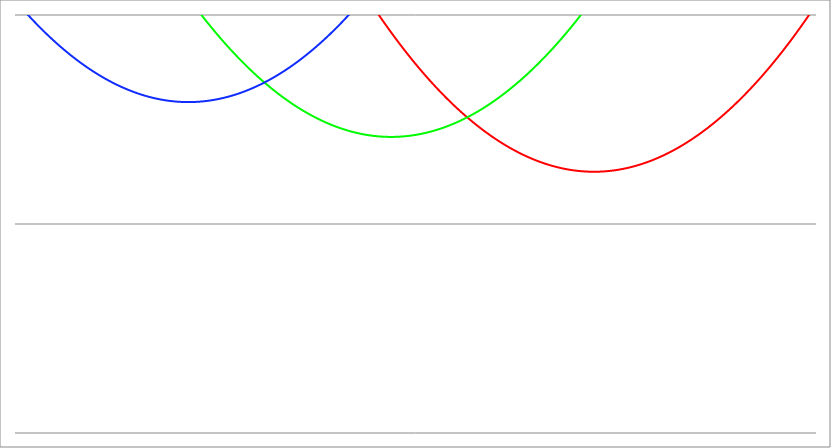
| Category | Series 1 | Series 0 | Series 2 |
|---|---|---|---|
| -3.7 | 33.99 | 16.19 | 6.39 |
| -3.69605 | 33.945 | 16.161 | 6.377 |
| -3.6921 | 33.9 | 16.132 | 6.363 |
| -3.68815 | 33.855 | 16.102 | 6.35 |
| -3.6842 | 33.81 | 16.073 | 6.337 |
| -3.680249999999999 | 33.765 | 16.044 | 6.323 |
| -3.676299999999999 | 33.72 | 16.015 | 6.31 |
| -3.672349999999999 | 33.676 | 15.986 | 6.297 |
| -3.6684 | 33.631 | 15.957 | 6.284 |
| -3.664449999999999 | 33.586 | 15.928 | 6.27 |
| -3.660499999999999 | 33.541 | 15.899 | 6.257 |
| -3.656549999999999 | 33.497 | 15.87 | 6.244 |
| -3.652599999999999 | 33.452 | 15.841 | 6.231 |
| -3.648649999999999 | 33.407 | 15.813 | 6.218 |
| -3.644699999999998 | 33.363 | 15.784 | 6.205 |
| -3.640749999999998 | 33.318 | 15.755 | 6.192 |
| -3.636799999999998 | 33.274 | 15.726 | 6.179 |
| -3.632849999999998 | 33.229 | 15.698 | 6.166 |
| -3.628899999999998 | 33.185 | 15.669 | 6.153 |
| -3.624949999999998 | 33.14 | 15.64 | 6.14 |
| -3.620999999999998 | 33.096 | 15.612 | 6.128 |
| -3.617049999999998 | 33.051 | 15.583 | 6.115 |
| -3.613099999999997 | 33.007 | 15.554 | 6.102 |
| -3.609149999999997 | 32.963 | 15.526 | 6.089 |
| -3.605199999999997 | 32.918 | 15.497 | 6.077 |
| -3.601249999999997 | 32.874 | 15.469 | 6.064 |
| -3.597299999999997 | 32.83 | 15.441 | 6.051 |
| -3.593349999999997 | 32.786 | 15.412 | 6.039 |
| -3.589399999999997 | 32.741 | 15.384 | 6.026 |
| -3.585449999999997 | 32.697 | 15.355 | 6.014 |
| -3.581499999999997 | 32.653 | 15.327 | 6.001 |
| -3.577549999999996 | 32.609 | 15.299 | 5.989 |
| -3.573599999999996 | 32.565 | 15.271 | 5.976 |
| -3.569649999999996 | 32.521 | 15.242 | 5.964 |
| -3.565699999999996 | 32.477 | 15.214 | 5.951 |
| -3.561749999999996 | 32.433 | 15.186 | 5.939 |
| -3.557799999999996 | 32.389 | 15.158 | 5.927 |
| -3.553849999999996 | 32.345 | 15.13 | 5.914 |
| -3.549899999999996 | 32.301 | 15.102 | 5.902 |
| -3.545949999999995 | 32.258 | 15.074 | 5.89 |
| -3.541999999999995 | 32.214 | 15.046 | 5.878 |
| -3.538049999999995 | 32.17 | 15.018 | 5.866 |
| -3.534099999999995 | 32.126 | 14.99 | 5.853 |
| -3.530149999999995 | 32.083 | 14.962 | 5.841 |
| -3.526199999999995 | 32.039 | 14.934 | 5.829 |
| -3.522249999999995 | 31.995 | 14.906 | 5.817 |
| -3.518299999999995 | 31.952 | 14.878 | 5.805 |
| -3.514349999999995 | 31.908 | 14.851 | 5.793 |
| -3.510399999999994 | 31.865 | 14.823 | 5.781 |
| -3.506449999999994 | 31.821 | 14.795 | 5.769 |
| -3.502499999999994 | 31.778 | 14.768 | 5.758 |
| -3.498549999999994 | 31.734 | 14.74 | 5.746 |
| -3.494599999999994 | 31.691 | 14.712 | 5.734 |
| -3.490649999999994 | 31.647 | 14.685 | 5.722 |
| -3.486699999999994 | 31.604 | 14.657 | 5.71 |
| -3.482749999999994 | 31.561 | 14.63 | 5.699 |
| -3.478799999999993 | 31.517 | 14.602 | 5.687 |
| -3.474849999999993 | 31.474 | 14.575 | 5.675 |
| -3.470899999999993 | 31.431 | 14.547 | 5.664 |
| -3.466949999999993 | 31.388 | 14.52 | 5.652 |
| -3.462999999999993 | 31.344 | 14.492 | 5.64 |
| -3.459049999999993 | 31.301 | 14.465 | 5.629 |
| -3.455099999999993 | 31.258 | 14.438 | 5.617 |
| -3.451149999999993 | 31.215 | 14.41 | 5.606 |
| -3.447199999999992 | 31.172 | 14.383 | 5.594 |
| -3.443249999999992 | 31.129 | 14.356 | 5.583 |
| -3.439299999999992 | 31.086 | 14.329 | 5.572 |
| -3.435349999999992 | 31.043 | 14.302 | 5.56 |
| -3.431399999999992 | 31 | 14.275 | 5.549 |
| -3.427449999999992 | 30.957 | 14.247 | 5.538 |
| -3.423499999999992 | 30.914 | 14.22 | 5.526 |
| -3.419549999999992 | 30.872 | 14.193 | 5.515 |
| -3.415599999999992 | 30.829 | 14.166 | 5.504 |
| -3.411649999999991 | 30.786 | 14.139 | 5.493 |
| -3.407699999999991 | 30.743 | 14.112 | 5.482 |
| -3.403749999999991 | 30.701 | 14.086 | 5.471 |
| -3.399799999999991 | 30.658 | 14.059 | 5.459 |
| -3.395849999999991 | 30.615 | 14.032 | 5.448 |
| -3.391899999999991 | 30.573 | 14.005 | 5.437 |
| -3.387949999999991 | 30.53 | 13.978 | 5.426 |
| -3.383999999999991 | 30.487 | 13.951 | 5.415 |
| -3.38004999999999 | 30.445 | 13.925 | 5.405 |
| -3.37609999999999 | 30.402 | 13.898 | 5.394 |
| -3.37214999999999 | 30.36 | 13.871 | 5.383 |
| -3.36819999999999 | 30.318 | 13.845 | 5.372 |
| -3.36424999999999 | 30.275 | 13.818 | 5.361 |
| -3.36029999999999 | 30.233 | 13.792 | 5.35 |
| -3.35634999999999 | 30.19 | 13.765 | 5.34 |
| -3.35239999999999 | 30.148 | 13.739 | 5.329 |
| -3.348449999999989 | 30.106 | 13.712 | 5.318 |
| -3.344499999999989 | 30.064 | 13.686 | 5.308 |
| -3.340549999999989 | 30.021 | 13.659 | 5.297 |
| -3.336599999999989 | 29.979 | 13.633 | 5.286 |
| -3.332649999999989 | 29.937 | 13.607 | 5.276 |
| -3.328699999999989 | 29.895 | 13.58 | 5.265 |
| -3.324749999999989 | 29.853 | 13.554 | 5.255 |
| -3.320799999999989 | 29.811 | 13.528 | 5.245 |
| -3.316849999999988 | 29.769 | 13.501 | 5.234 |
| -3.312899999999988 | 29.727 | 13.475 | 5.224 |
| -3.308949999999988 | 29.685 | 13.449 | 5.213 |
| -3.304999999999988 | 29.643 | 13.423 | 5.203 |
| -3.301049999999988 | 29.601 | 13.397 | 5.193 |
| -3.297099999999988 | 29.559 | 13.371 | 5.182 |
| -3.293149999999988 | 29.517 | 13.345 | 5.172 |
| -3.289199999999988 | 29.476 | 13.319 | 5.162 |
| -3.285249999999988 | 29.434 | 13.293 | 5.152 |
| -3.281299999999987 | 29.392 | 13.267 | 5.142 |
| -3.277349999999987 | 29.35 | 13.241 | 5.132 |
| -3.273399999999987 | 29.309 | 13.215 | 5.122 |
| -3.269449999999987 | 29.267 | 13.189 | 5.112 |
| -3.265499999999987 | 29.225 | 13.163 | 5.101 |
| -3.261549999999987 | 29.184 | 13.138 | 5.092 |
| -3.257599999999987 | 29.142 | 13.112 | 5.082 |
| -3.253649999999987 | 29.101 | 13.086 | 5.072 |
| -3.249699999999986 | 29.059 | 13.061 | 5.062 |
| -3.245749999999986 | 29.018 | 13.035 | 5.052 |
| -3.241799999999986 | 28.976 | 13.009 | 5.042 |
| -3.237849999999986 | 28.935 | 12.984 | 5.032 |
| -3.233899999999986 | 28.894 | 12.958 | 5.023 |
| -3.229949999999986 | 28.852 | 12.933 | 5.013 |
| -3.225999999999986 | 28.811 | 12.907 | 5.003 |
| -3.222049999999986 | 28.77 | 12.882 | 4.993 |
| -3.218099999999986 | 28.729 | 12.856 | 4.984 |
| -3.214149999999985 | 28.687 | 12.831 | 4.974 |
| -3.210199999999985 | 28.646 | 12.805 | 4.965 |
| -3.206249999999985 | 28.605 | 12.78 | 4.955 |
| -3.202299999999985 | 28.564 | 12.755 | 4.946 |
| -3.198349999999985 | 28.523 | 12.729 | 4.936 |
| -3.194399999999985 | 28.482 | 12.704 | 4.927 |
| -3.190449999999985 | 28.441 | 12.679 | 4.917 |
| -3.186499999999985 | 28.4 | 12.654 | 4.908 |
| -3.182549999999984 | 28.359 | 12.629 | 4.898 |
| -3.178599999999984 | 28.318 | 12.603 | 4.889 |
| -3.174649999999984 | 28.277 | 12.578 | 4.88 |
| -3.170699999999984 | 28.236 | 12.553 | 4.871 |
| -3.166749999999984 | 28.195 | 12.528 | 4.861 |
| -3.162799999999984 | 28.155 | 12.503 | 4.852 |
| -3.158849999999984 | 28.114 | 12.478 | 4.843 |
| -3.154899999999984 | 28.073 | 12.453 | 4.834 |
| -3.150949999999983 | 28.032 | 12.428 | 4.825 |
| -3.146999999999983 | 27.992 | 12.404 | 4.816 |
| -3.143049999999983 | 27.951 | 12.379 | 4.807 |
| -3.139099999999983 | 27.91 | 12.354 | 4.798 |
| -3.135149999999983 | 27.87 | 12.329 | 4.789 |
| -3.131199999999983 | 27.829 | 12.304 | 4.78 |
| -3.127249999999983 | 27.789 | 12.28 | 4.771 |
| -3.123299999999983 | 27.748 | 12.255 | 4.762 |
| -3.119349999999983 | 27.708 | 12.23 | 4.753 |
| -3.115399999999982 | 27.667 | 12.206 | 4.744 |
| -3.111449999999982 | 27.627 | 12.181 | 4.735 |
| -3.107499999999982 | 27.587 | 12.157 | 4.727 |
| -3.103549999999982 | 27.546 | 12.132 | 4.718 |
| -3.099599999999982 | 27.506 | 12.108 | 4.709 |
| -3.095649999999982 | 27.466 | 12.083 | 4.7 |
| -3.091699999999982 | 27.425 | 12.059 | 4.692 |
| -3.087749999999982 | 27.385 | 12.034 | 4.683 |
| -3.083799999999981 | 27.345 | 12.01 | 4.675 |
| -3.079849999999981 | 27.305 | 11.985 | 4.666 |
| -3.075899999999981 | 27.265 | 11.961 | 4.658 |
| -3.071949999999981 | 27.225 | 11.937 | 4.649 |
| -3.067999999999981 | 27.185 | 11.913 | 4.641 |
| -3.064049999999981 | 27.145 | 11.888 | 4.632 |
| -3.060099999999981 | 27.105 | 11.864 | 4.624 |
| -3.056149999999981 | 27.065 | 11.84 | 4.615 |
| -3.05219999999998 | 27.025 | 11.816 | 4.607 |
| -3.04824999999998 | 26.985 | 11.792 | 4.599 |
| -3.04429999999998 | 26.945 | 11.768 | 4.591 |
| -3.04034999999998 | 26.905 | 11.744 | 4.582 |
| -3.03639999999998 | 26.865 | 11.72 | 4.574 |
| -3.03244999999998 | 26.826 | 11.696 | 4.566 |
| -3.02849999999998 | 26.786 | 11.672 | 4.558 |
| -3.02454999999998 | 26.746 | 11.648 | 4.55 |
| -3.02059999999998 | 26.706 | 11.624 | 4.542 |
| -3.016649999999979 | 26.667 | 11.6 | 4.534 |
| -3.012699999999979 | 26.627 | 11.576 | 4.526 |
| -3.008749999999979 | 26.588 | 11.553 | 4.518 |
| -3.00479999999998 | 26.548 | 11.529 | 4.51 |
| -3.000849999999979 | 26.509 | 11.505 | 4.502 |
| -2.996899999999979 | 26.469 | 11.481 | 4.494 |
| -2.992949999999979 | 26.43 | 11.458 | 4.486 |
| -2.988999999999979 | 26.39 | 11.434 | 4.478 |
| -2.985049999999978 | 26.351 | 11.411 | 4.47 |
| -2.981099999999978 | 26.311 | 11.387 | 4.463 |
| -2.977149999999978 | 26.272 | 11.363 | 4.455 |
| -2.973199999999978 | 26.233 | 11.34 | 4.447 |
| -2.969249999999978 | 26.193 | 11.316 | 4.439 |
| -2.965299999999978 | 26.154 | 11.293 | 4.432 |
| -2.961349999999978 | 26.115 | 11.27 | 4.424 |
| -2.957399999999978 | 26.076 | 11.246 | 4.417 |
| -2.953449999999977 | 26.037 | 11.223 | 4.409 |
| -2.949499999999977 | 25.998 | 11.2 | 4.402 |
| -2.945549999999977 | 25.958 | 11.176 | 4.394 |
| -2.941599999999977 | 25.919 | 11.153 | 4.387 |
| -2.937649999999977 | 25.88 | 11.13 | 4.379 |
| -2.933699999999977 | 25.841 | 11.107 | 4.372 |
| -2.929749999999977 | 25.802 | 11.083 | 4.364 |
| -2.925799999999977 | 25.764 | 11.06 | 4.357 |
| -2.921849999999976 | 25.725 | 11.037 | 4.35 |
| -2.917899999999976 | 25.686 | 11.014 | 4.343 |
| -2.913949999999976 | 25.647 | 10.991 | 4.335 |
| -2.909999999999976 | 25.608 | 10.968 | 4.328 |
| -2.906049999999976 | 25.569 | 10.945 | 4.321 |
| -2.902099999999976 | 25.531 | 10.922 | 4.314 |
| -2.898149999999976 | 25.492 | 10.899 | 4.307 |
| -2.894199999999976 | 25.453 | 10.876 | 4.3 |
| -2.890249999999975 | 25.415 | 10.854 | 4.293 |
| -2.886299999999975 | 25.376 | 10.831 | 4.286 |
| -2.882349999999975 | 25.337 | 10.808 | 4.279 |
| -2.878399999999975 | 25.299 | 10.785 | 4.272 |
| -2.874449999999975 | 25.26 | 10.762 | 4.265 |
| -2.870499999999975 | 25.222 | 10.74 | 4.258 |
| -2.866549999999975 | 25.183 | 10.717 | 4.251 |
| -2.862599999999975 | 25.145 | 10.694 | 4.244 |
| -2.858649999999975 | 25.106 | 10.672 | 4.237 |
| -2.854699999999974 | 25.068 | 10.649 | 4.231 |
| -2.850749999999974 | 25.03 | 10.627 | 4.224 |
| -2.846799999999974 | 24.991 | 10.604 | 4.217 |
| -2.842849999999974 | 24.953 | 10.582 | 4.21 |
| -2.838899999999974 | 24.915 | 10.559 | 4.204 |
| -2.834949999999974 | 24.877 | 10.537 | 4.197 |
| -2.830999999999974 | 24.839 | 10.515 | 4.191 |
| -2.827049999999974 | 24.8 | 10.492 | 4.184 |
| -2.823099999999973 | 24.762 | 10.47 | 4.177 |
| -2.819149999999973 | 24.724 | 10.448 | 4.171 |
| -2.815199999999973 | 24.686 | 10.425 | 4.165 |
| -2.811249999999973 | 24.648 | 10.403 | 4.158 |
| -2.807299999999973 | 24.61 | 10.381 | 4.152 |
| -2.803349999999973 | 24.572 | 10.359 | 4.145 |
| -2.799399999999973 | 24.534 | 10.337 | 4.139 |
| -2.795449999999973 | 24.496 | 10.315 | 4.133 |
| -2.791499999999972 | 24.458 | 10.292 | 4.126 |
| -2.787549999999972 | 24.421 | 10.27 | 4.12 |
| -2.783599999999972 | 24.383 | 10.248 | 4.114 |
| -2.779649999999972 | 24.345 | 10.226 | 4.108 |
| -2.775699999999972 | 24.307 | 10.205 | 4.102 |
| -2.771749999999972 | 24.27 | 10.183 | 4.096 |
| -2.767799999999972 | 24.232 | 10.161 | 4.09 |
| -2.763849999999972 | 24.194 | 10.139 | 4.083 |
| -2.759899999999972 | 24.157 | 10.117 | 4.077 |
| -2.755949999999971 | 24.119 | 10.095 | 4.071 |
| -2.751999999999971 | 24.082 | 10.074 | 4.066 |
| -2.748049999999971 | 24.044 | 10.052 | 4.06 |
| -2.744099999999971 | 24.006 | 10.03 | 4.054 |
| -2.740149999999971 | 23.969 | 10.008 | 4.048 |
| -2.736199999999971 | 23.932 | 9.987 | 4.042 |
| -2.732249999999971 | 23.894 | 9.965 | 4.036 |
| -2.728299999999971 | 23.857 | 9.944 | 4.03 |
| -2.72434999999997 | 23.819 | 9.922 | 4.025 |
| -2.72039999999997 | 23.782 | 9.901 | 4.019 |
| -2.71644999999997 | 23.745 | 9.879 | 4.013 |
| -2.71249999999997 | 23.708 | 9.858 | 4.008 |
| -2.70854999999997 | 23.67 | 9.836 | 4.002 |
| -2.70459999999997 | 23.633 | 9.815 | 3.996 |
| -2.70064999999997 | 23.596 | 9.794 | 3.991 |
| -2.69669999999997 | 23.559 | 9.772 | 3.985 |
| -2.692749999999969 | 23.522 | 9.751 | 3.98 |
| -2.688799999999969 | 23.485 | 9.73 | 3.974 |
| -2.684849999999969 | 23.448 | 9.708 | 3.969 |
| -2.680899999999969 | 23.411 | 9.687 | 3.964 |
| -2.676949999999969 | 23.374 | 9.666 | 3.958 |
| -2.672999999999969 | 23.337 | 9.645 | 3.953 |
| -2.669049999999969 | 23.3 | 9.624 | 3.948 |
| -2.665099999999969 | 23.263 | 9.603 | 3.942 |
| -2.661149999999968 | 23.226 | 9.582 | 3.937 |
| -2.657199999999968 | 23.19 | 9.561 | 3.932 |
| -2.653249999999968 | 23.153 | 9.54 | 3.927 |
| -2.649299999999968 | 23.116 | 9.519 | 3.922 |
| -2.645349999999968 | 23.079 | 9.498 | 3.916 |
| -2.641399999999968 | 23.043 | 9.477 | 3.911 |
| -2.637449999999968 | 23.006 | 9.456 | 3.906 |
| -2.633499999999968 | 22.969 | 9.435 | 3.901 |
| -2.629549999999968 | 22.933 | 9.415 | 3.896 |
| -2.625599999999967 | 22.896 | 9.394 | 3.891 |
| -2.621649999999967 | 22.86 | 9.373 | 3.886 |
| -2.617699999999967 | 22.823 | 9.352 | 3.882 |
| -2.613749999999967 | 22.787 | 9.332 | 3.877 |
| -2.609799999999967 | 22.75 | 9.311 | 3.872 |
| -2.605849999999967 | 22.714 | 9.29 | 3.867 |
| -2.601899999999967 | 22.677 | 9.27 | 3.862 |
| -2.597949999999967 | 22.641 | 9.249 | 3.858 |
| -2.593999999999967 | 22.605 | 9.229 | 3.853 |
| -2.590049999999966 | 22.569 | 9.208 | 3.848 |
| -2.586099999999966 | 22.532 | 9.188 | 3.844 |
| -2.582149999999966 | 22.496 | 9.167 | 3.839 |
| -2.578199999999966 | 22.46 | 9.147 | 3.834 |
| -2.574249999999966 | 22.424 | 9.127 | 3.83 |
| -2.570299999999966 | 22.388 | 9.106 | 3.825 |
| -2.566349999999966 | 22.352 | 9.086 | 3.821 |
| -2.562399999999966 | 22.315 | 9.066 | 3.816 |
| -2.558449999999965 | 22.279 | 9.046 | 3.812 |
| -2.554499999999965 | 22.243 | 9.025 | 3.807 |
| -2.550549999999965 | 22.208 | 9.005 | 3.803 |
| -2.546599999999965 | 22.172 | 8.985 | 3.799 |
| -2.542649999999965 | 22.136 | 8.965 | 3.794 |
| -2.538699999999965 | 22.1 | 8.945 | 3.79 |
| -2.534749999999965 | 22.064 | 8.925 | 3.786 |
| -2.530799999999965 | 22.028 | 8.905 | 3.782 |
| -2.526849999999965 | 21.992 | 8.885 | 3.778 |
| -2.522899999999964 | 21.957 | 8.865 | 3.773 |
| -2.518949999999964 | 21.921 | 8.845 | 3.769 |
| -2.514999999999964 | 21.885 | 8.825 | 3.765 |
| -2.511049999999964 | 21.85 | 8.805 | 3.761 |
| -2.507099999999964 | 21.814 | 8.786 | 3.757 |
| -2.503149999999964 | 21.778 | 8.766 | 3.753 |
| -2.499199999999964 | 21.743 | 8.746 | 3.749 |
| -2.495249999999964 | 21.707 | 8.726 | 3.745 |
| -2.491299999999963 | 21.672 | 8.707 | 3.741 |
| -2.487349999999963 | 21.636 | 8.687 | 3.738 |
| -2.483399999999963 | 21.601 | 8.667 | 3.734 |
| -2.479449999999963 | 21.565 | 8.648 | 3.73 |
| -2.475499999999963 | 21.53 | 8.628 | 3.726 |
| -2.471549999999963 | 21.495 | 8.609 | 3.722 |
| -2.467599999999963 | 21.459 | 8.589 | 3.719 |
| -2.463649999999963 | 21.424 | 8.57 | 3.715 |
| -2.459699999999962 | 21.389 | 8.55 | 3.711 |
| -2.455749999999962 | 21.354 | 8.531 | 3.708 |
| -2.451799999999962 | 21.319 | 8.511 | 3.704 |
| -2.447849999999962 | 21.283 | 8.492 | 3.701 |
| -2.443899999999962 | 21.248 | 8.473 | 3.697 |
| -2.439949999999962 | 21.213 | 8.453 | 3.694 |
| -2.435999999999962 | 21.178 | 8.434 | 3.69 |
| -2.432049999999962 | 21.143 | 8.415 | 3.687 |
| -2.428099999999961 | 21.108 | 8.396 | 3.683 |
| -2.424149999999961 | 21.073 | 8.377 | 3.68 |
| -2.420199999999961 | 21.038 | 8.357 | 3.677 |
| -2.416249999999961 | 21.003 | 8.338 | 3.673 |
| -2.412299999999961 | 20.968 | 8.319 | 3.67 |
| -2.408349999999961 | 20.934 | 8.3 | 3.667 |
| -2.404399999999961 | 20.899 | 8.281 | 3.664 |
| -2.400449999999961 | 20.864 | 8.262 | 3.66 |
| -2.39649999999996 | 20.829 | 8.243 | 3.657 |
| -2.39254999999996 | 20.794 | 8.224 | 3.654 |
| -2.38859999999996 | 20.76 | 8.205 | 3.651 |
| -2.38464999999996 | 20.725 | 8.187 | 3.648 |
| -2.38069999999996 | 20.691 | 8.168 | 3.645 |
| -2.37674999999996 | 20.656 | 8.149 | 3.642 |
| -2.37279999999996 | 20.621 | 8.13 | 3.639 |
| -2.36884999999996 | 20.587 | 8.111 | 3.636 |
| -2.36489999999996 | 20.552 | 8.093 | 3.633 |
| -2.360949999999959 | 20.518 | 8.074 | 3.63 |
| -2.356999999999959 | 20.483 | 8.055 | 3.627 |
| -2.353049999999959 | 20.449 | 8.037 | 3.625 |
| -2.349099999999959 | 20.415 | 8.018 | 3.622 |
| -2.345149999999959 | 20.38 | 8 | 3.619 |
| -2.341199999999959 | 20.346 | 7.981 | 3.616 |
| -2.337249999999959 | 20.312 | 7.963 | 3.614 |
| -2.333299999999959 | 20.277 | 7.944 | 3.611 |
| -2.329349999999958 | 20.243 | 7.926 | 3.608 |
| -2.325399999999958 | 20.209 | 7.907 | 3.606 |
| -2.321449999999958 | 20.175 | 7.889 | 3.603 |
| -2.317499999999958 | 20.141 | 7.871 | 3.601 |
| -2.313549999999958 | 20.107 | 7.853 | 3.598 |
| -2.309599999999958 | 20.073 | 7.834 | 3.596 |
| -2.305649999999958 | 20.039 | 7.816 | 3.593 |
| -2.301699999999958 | 20.005 | 7.798 | 3.591 |
| -2.297749999999958 | 19.971 | 7.78 | 3.589 |
| -2.293799999999957 | 19.937 | 7.762 | 3.586 |
| -2.289849999999957 | 19.903 | 7.743 | 3.584 |
| -2.285899999999957 | 19.869 | 7.725 | 3.582 |
| -2.281949999999957 | 19.835 | 7.707 | 3.579 |
| -2.277999999999957 | 19.801 | 7.689 | 3.577 |
| -2.274049999999957 | 19.768 | 7.671 | 3.575 |
| -2.270099999999957 | 19.734 | 7.653 | 3.573 |
| -2.266149999999957 | 19.7 | 7.635 | 3.571 |
| -2.262199999999956 | 19.666 | 7.618 | 3.569 |
| -2.258249999999956 | 19.633 | 7.6 | 3.567 |
| -2.254299999999956 | 19.599 | 7.582 | 3.565 |
| -2.250349999999956 | 19.565 | 7.564 | 3.563 |
| -2.246399999999956 | 19.532 | 7.546 | 3.561 |
| -2.242449999999956 | 19.498 | 7.529 | 3.559 |
| -2.238499999999956 | 19.465 | 7.511 | 3.557 |
| -2.234549999999956 | 19.431 | 7.493 | 3.555 |
| -2.230599999999955 | 19.398 | 7.476 | 3.553 |
| -2.226649999999955 | 19.365 | 7.458 | 3.551 |
| -2.222699999999955 | 19.331 | 7.44 | 3.55 |
| -2.218749999999955 | 19.298 | 7.423 | 3.548 |
| -2.214799999999955 | 19.265 | 7.405 | 3.546 |
| -2.210849999999955 | 19.231 | 7.388 | 3.544 |
| -2.206899999999955 | 19.198 | 7.37 | 3.543 |
| -2.202949999999955 | 19.165 | 7.353 | 3.541 |
| -2.198999999999955 | 19.132 | 7.336 | 3.54 |
| -2.195049999999954 | 19.098 | 7.318 | 3.538 |
| -2.191099999999954 | 19.065 | 7.301 | 3.537 |
| -2.187149999999954 | 19.032 | 7.284 | 3.535 |
| -2.183199999999954 | 18.999 | 7.266 | 3.534 |
| -2.179249999999954 | 18.966 | 7.249 | 3.532 |
| -2.175299999999954 | 18.933 | 7.232 | 3.531 |
| -2.171349999999954 | 18.9 | 7.215 | 3.529 |
| -2.167399999999953 | 18.867 | 7.198 | 3.528 |
| -2.163449999999953 | 18.834 | 7.181 | 3.527 |
| -2.159499999999953 | 18.801 | 7.163 | 3.525 |
| -2.155549999999953 | 18.769 | 7.146 | 3.524 |
| -2.151599999999953 | 18.736 | 7.129 | 3.523 |
| -2.147649999999953 | 18.703 | 7.112 | 3.522 |
| -2.143699999999953 | 18.67 | 7.095 | 3.521 |
| -2.139749999999953 | 18.638 | 7.079 | 3.52 |
| -2.135799999999953 | 18.605 | 7.062 | 3.518 |
| -2.131849999999952 | 18.572 | 7.045 | 3.517 |
| -2.127899999999952 | 18.54 | 7.028 | 3.516 |
| -2.123949999999952 | 18.507 | 7.011 | 3.515 |
| -2.119999999999952 | 18.474 | 6.994 | 3.514 |
| -2.116049999999952 | 18.442 | 6.978 | 3.513 |
| -2.112099999999952 | 18.409 | 6.961 | 3.513 |
| -2.108149999999952 | 18.377 | 6.944 | 3.512 |
| -2.104199999999952 | 18.344 | 6.928 | 3.511 |
| -2.100249999999952 | 18.312 | 6.911 | 3.51 |
| -2.096299999999951 | 18.28 | 6.894 | 3.509 |
| -2.092349999999951 | 18.247 | 6.878 | 3.509 |
| -2.088399999999951 | 18.215 | 6.861 | 3.508 |
| -2.084449999999951 | 18.183 | 6.845 | 3.507 |
| -2.080499999999951 | 18.15 | 6.828 | 3.506 |
| -2.076549999999951 | 18.118 | 6.812 | 3.506 |
| -2.072599999999951 | 18.086 | 6.796 | 3.505 |
| -2.068649999999951 | 18.054 | 6.779 | 3.505 |
| -2.06469999999995 | 18.022 | 6.763 | 3.504 |
| -2.06074999999995 | 17.99 | 6.747 | 3.504 |
| -2.05679999999995 | 17.958 | 6.73 | 3.503 |
| -2.05284999999995 | 17.926 | 6.714 | 3.503 |
| -2.04889999999995 | 17.894 | 6.698 | 3.502 |
| -2.04494999999995 | 17.862 | 6.682 | 3.502 |
| -2.04099999999995 | 17.83 | 6.666 | 3.502 |
| -2.03704999999995 | 17.798 | 6.65 | 3.501 |
| -2.033099999999949 | 17.766 | 6.633 | 3.501 |
| -2.029149999999949 | 17.734 | 6.617 | 3.501 |
| -2.025199999999949 | 17.702 | 6.601 | 3.501 |
| -2.021249999999949 | 17.67 | 6.585 | 3.5 |
| -2.017299999999949 | 17.639 | 6.569 | 3.5 |
| -2.013349999999949 | 17.607 | 6.554 | 3.5 |
| -2.009399999999949 | 17.575 | 6.538 | 3.5 |
| -2.005449999999949 | 17.544 | 6.522 | 3.5 |
| -2.001499999999949 | 17.512 | 6.506 | 3.5 |
| -1.997549999999949 | 17.48 | 6.49 | 3.5 |
| -1.993599999999949 | 17.449 | 6.474 | 3.5 |
| -1.989649999999949 | 17.417 | 6.459 | 3.5 |
| -1.985699999999949 | 17.386 | 6.443 | 3.5 |
| -1.981749999999949 | 17.354 | 6.427 | 3.5 |
| -1.977799999999949 | 17.323 | 6.412 | 3.5 |
| -1.973849999999949 | 17.291 | 6.396 | 3.501 |
| -1.969899999999949 | 17.26 | 6.381 | 3.501 |
| -1.965949999999949 | 17.229 | 6.365 | 3.501 |
| -1.96199999999995 | 17.197 | 6.349 | 3.501 |
| -1.95804999999995 | 17.166 | 6.334 | 3.502 |
| -1.95409999999995 | 17.135 | 6.319 | 3.502 |
| -1.95014999999995 | 17.104 | 6.303 | 3.502 |
| -1.94619999999995 | 17.072 | 6.288 | 3.503 |
| -1.94224999999995 | 17.041 | 6.272 | 3.503 |
| -1.93829999999995 | 17.01 | 6.257 | 3.504 |
| -1.93434999999995 | 16.979 | 6.242 | 3.504 |
| -1.93039999999995 | 16.948 | 6.226 | 3.505 |
| -1.92644999999995 | 16.917 | 6.211 | 3.505 |
| -1.922499999999951 | 16.886 | 6.196 | 3.506 |
| -1.918549999999951 | 16.855 | 6.181 | 3.507 |
| -1.914599999999951 | 16.824 | 6.166 | 3.507 |
| -1.910649999999951 | 16.793 | 6.151 | 3.508 |
| -1.906699999999951 | 16.762 | 6.136 | 3.509 |
| -1.902749999999951 | 16.731 | 6.12 | 3.509 |
| -1.898799999999951 | 16.701 | 6.105 | 3.51 |
| -1.894849999999951 | 16.67 | 6.09 | 3.511 |
| -1.890899999999951 | 16.639 | 6.076 | 3.512 |
| -1.886949999999951 | 16.608 | 6.061 | 3.513 |
| -1.882999999999952 | 16.578 | 6.046 | 3.514 |
| -1.879049999999952 | 16.547 | 6.031 | 3.515 |
| -1.875099999999952 | 16.516 | 6.016 | 3.516 |
| -1.871149999999952 | 16.486 | 6.001 | 3.517 |
| -1.867199999999952 | 16.455 | 5.986 | 3.518 |
| -1.863249999999952 | 16.425 | 5.972 | 3.519 |
| -1.859299999999952 | 16.394 | 5.957 | 3.52 |
| -1.855349999999952 | 16.364 | 5.942 | 3.521 |
| -1.851399999999952 | 16.333 | 5.928 | 3.522 |
| -1.847449999999952 | 16.303 | 5.913 | 3.523 |
| -1.843499999999953 | 16.272 | 5.898 | 3.524 |
| -1.839549999999953 | 16.242 | 5.884 | 3.526 |
| -1.835599999999953 | 16.212 | 5.869 | 3.527 |
| -1.831649999999953 | 16.182 | 5.855 | 3.528 |
| -1.827699999999953 | 16.151 | 5.84 | 3.53 |
| -1.823749999999953 | 16.121 | 5.826 | 3.531 |
| -1.819799999999953 | 16.091 | 5.812 | 3.532 |
| -1.815849999999953 | 16.061 | 5.797 | 3.534 |
| -1.811899999999953 | 16.031 | 5.783 | 3.535 |
| -1.807949999999953 | 16 | 5.769 | 3.537 |
| -1.803999999999954 | 15.97 | 5.754 | 3.538 |
| -1.800049999999954 | 15.94 | 5.74 | 3.54 |
| -1.796099999999954 | 15.91 | 5.726 | 3.542 |
| -1.792149999999954 | 15.88 | 5.712 | 3.543 |
| -1.788199999999954 | 15.85 | 5.698 | 3.545 |
| -1.784249999999954 | 15.821 | 5.684 | 3.547 |
| -1.780299999999954 | 15.791 | 5.669 | 3.548 |
| -1.776349999999954 | 15.761 | 5.655 | 3.55 |
| -1.772399999999954 | 15.731 | 5.641 | 3.552 |
| -1.768449999999954 | 15.701 | 5.627 | 3.554 |
| -1.764499999999955 | 15.671 | 5.613 | 3.555 |
| -1.760549999999955 | 15.642 | 5.6 | 3.557 |
| -1.756599999999955 | 15.612 | 5.586 | 3.559 |
| -1.752649999999955 | 15.582 | 5.572 | 3.561 |
| -1.748699999999955 | 15.553 | 5.558 | 3.563 |
| -1.744749999999955 | 15.523 | 5.544 | 3.565 |
| -1.740799999999955 | 15.494 | 5.53 | 3.567 |
| -1.736849999999955 | 15.464 | 5.517 | 3.569 |
| -1.732899999999955 | 15.435 | 5.503 | 3.571 |
| -1.728949999999956 | 15.405 | 5.489 | 3.573 |
| -1.724999999999956 | 15.376 | 5.476 | 3.576 |
| -1.721049999999956 | 15.346 | 5.462 | 3.578 |
| -1.717099999999956 | 15.317 | 5.448 | 3.58 |
| -1.713149999999956 | 15.287 | 5.435 | 3.582 |
| -1.709199999999956 | 15.258 | 5.421 | 3.585 |
| -1.705249999999956 | 15.229 | 5.408 | 3.587 |
| -1.701299999999956 | 15.2 | 5.394 | 3.589 |
| -1.697349999999956 | 15.17 | 5.381 | 3.592 |
| -1.693399999999956 | 15.141 | 5.368 | 3.594 |
| -1.689449999999956 | 15.112 | 5.354 | 3.596 |
| -1.685499999999957 | 15.083 | 5.341 | 3.599 |
| -1.681549999999957 | 15.054 | 5.328 | 3.601 |
| -1.677599999999957 | 15.025 | 5.314 | 3.604 |
| -1.673649999999957 | 14.996 | 5.301 | 3.607 |
| -1.669699999999957 | 14.967 | 5.288 | 3.609 |
| -1.665749999999957 | 14.938 | 5.275 | 3.612 |
| -1.661799999999957 | 14.909 | 5.262 | 3.614 |
| -1.657849999999957 | 14.88 | 5.248 | 3.617 |
| -1.653899999999957 | 14.851 | 5.235 | 3.62 |
| -1.649949999999958 | 14.822 | 5.222 | 3.623 |
| -1.645999999999958 | 14.793 | 5.209 | 3.625 |
| -1.642049999999958 | 14.765 | 5.196 | 3.628 |
| -1.638099999999958 | 14.736 | 5.183 | 3.631 |
| -1.634149999999958 | 14.707 | 5.17 | 3.634 |
| -1.630199999999958 | 14.678 | 5.158 | 3.637 |
| -1.626249999999958 | 14.65 | 5.145 | 3.64 |
| -1.622299999999958 | 14.621 | 5.132 | 3.643 |
| -1.618349999999958 | 14.592 | 5.119 | 3.646 |
| -1.614399999999958 | 14.564 | 5.106 | 3.649 |
| -1.610449999999959 | 14.535 | 5.094 | 3.652 |
| -1.606499999999959 | 14.507 | 5.081 | 3.655 |
| -1.602549999999959 | 14.478 | 5.068 | 3.658 |
| -1.598599999999959 | 14.45 | 5.056 | 3.661 |
| -1.59464999999996 | 14.422 | 5.043 | 3.664 |
| -1.590699999999959 | 14.393 | 5.03 | 3.668 |
| -1.586749999999959 | 14.365 | 5.018 | 3.671 |
| -1.582799999999959 | 14.336 | 5.005 | 3.674 |
| -1.578849999999959 | 14.308 | 4.993 | 3.677 |
| -1.57489999999996 | 14.28 | 4.98 | 3.681 |
| -1.57094999999996 | 14.252 | 4.968 | 3.684 |
| -1.56699999999996 | 14.223 | 4.955 | 3.687 |
| -1.56304999999996 | 14.195 | 4.943 | 3.691 |
| -1.55909999999996 | 14.167 | 4.931 | 3.694 |
| -1.55514999999996 | 14.139 | 4.918 | 3.698 |
| -1.55119999999996 | 14.111 | 4.906 | 3.701 |
| -1.54724999999996 | 14.083 | 4.894 | 3.705 |
| -1.54329999999996 | 14.055 | 4.882 | 3.709 |
| -1.53934999999996 | 14.027 | 4.87 | 3.712 |
| -1.535399999999961 | 13.999 | 4.857 | 3.716 |
| -1.531449999999961 | 13.971 | 4.845 | 3.72 |
| -1.527499999999961 | 13.943 | 4.833 | 3.723 |
| -1.523549999999961 | 13.915 | 4.821 | 3.727 |
| -1.519599999999961 | 13.888 | 4.809 | 3.731 |
| -1.515649999999961 | 13.86 | 4.797 | 3.735 |
| -1.511699999999961 | 13.832 | 4.785 | 3.738 |
| -1.507749999999961 | 13.804 | 4.773 | 3.742 |
| -1.503799999999961 | 13.777 | 4.761 | 3.746 |
| -1.499849999999961 | 13.749 | 4.75 | 3.75 |
| -1.495899999999962 | 13.721 | 4.738 | 3.754 |
| -1.491949999999962 | 13.694 | 4.726 | 3.758 |
| -1.487999999999962 | 13.666 | 4.714 | 3.762 |
| -1.484049999999962 | 13.639 | 4.702 | 3.766 |
| -1.480099999999962 | 13.611 | 4.691 | 3.77 |
| -1.476149999999962 | 13.584 | 4.679 | 3.774 |
| -1.472199999999962 | 13.556 | 4.667 | 3.779 |
| -1.468249999999962 | 13.529 | 4.656 | 3.783 |
| -1.464299999999962 | 13.501 | 4.644 | 3.787 |
| -1.460349999999962 | 13.474 | 4.633 | 3.791 |
| -1.456399999999963 | 13.447 | 4.621 | 3.796 |
| -1.452449999999963 | 13.419 | 4.61 | 3.8 |
| -1.448499999999963 | 13.392 | 4.598 | 3.804 |
| -1.444549999999963 | 13.365 | 4.587 | 3.809 |
| -1.440599999999963 | 13.338 | 4.575 | 3.813 |
| -1.436649999999963 | 13.311 | 4.564 | 3.817 |
| -1.432699999999963 | 13.283 | 4.553 | 3.822 |
| -1.428749999999963 | 13.256 | 4.541 | 3.826 |
| -1.424799999999963 | 13.229 | 4.53 | 3.831 |
| -1.420849999999964 | 13.202 | 4.519 | 3.835 |
| -1.416899999999964 | 13.175 | 4.508 | 3.84 |
| -1.412949999999964 | 13.148 | 4.496 | 3.845 |
| -1.408999999999964 | 13.121 | 4.485 | 3.849 |
| -1.405049999999964 | 13.094 | 4.474 | 3.854 |
| -1.401099999999964 | 13.067 | 4.463 | 3.859 |
| -1.397149999999964 | 13.041 | 4.452 | 3.863 |
| -1.393199999999964 | 13.014 | 4.441 | 3.868 |
| -1.389249999999964 | 12.987 | 4.43 | 3.873 |
| -1.385299999999964 | 12.96 | 4.419 | 3.878 |
| -1.381349999999964 | 12.934 | 4.408 | 3.883 |
| -1.377399999999965 | 12.907 | 4.397 | 3.888 |
| -1.373449999999965 | 12.88 | 4.386 | 3.893 |
| -1.369499999999965 | 12.854 | 4.376 | 3.898 |
| -1.365549999999965 | 12.827 | 4.365 | 3.903 |
| -1.361599999999965 | 12.8 | 4.354 | 3.908 |
| -1.357649999999965 | 12.774 | 4.343 | 3.913 |
| -1.353699999999965 | 12.747 | 4.333 | 3.918 |
| -1.349749999999965 | 12.721 | 4.322 | 3.923 |
| -1.345799999999965 | 12.694 | 4.311 | 3.928 |
| -1.341849999999966 | 12.668 | 4.301 | 3.933 |
| -1.337899999999966 | 12.642 | 4.29 | 3.938 |
| -1.333949999999966 | 12.615 | 4.279 | 3.944 |
| -1.329999999999966 | 12.589 | 4.269 | 3.949 |
| -1.326049999999966 | 12.563 | 4.258 | 3.954 |
| -1.322099999999966 | 12.536 | 4.248 | 3.96 |
| -1.318149999999966 | 12.51 | 4.238 | 3.965 |
| -1.314199999999966 | 12.484 | 4.227 | 3.97 |
| -1.310249999999966 | 12.458 | 4.217 | 3.976 |
| -1.306299999999966 | 12.432 | 4.206 | 3.981 |
| -1.302349999999967 | 12.406 | 4.196 | 3.987 |
| -1.298399999999967 | 12.379 | 4.186 | 3.992 |
| -1.294449999999967 | 12.353 | 4.176 | 3.998 |
| -1.290499999999967 | 12.327 | 4.165 | 4.003 |
| -1.286549999999967 | 12.301 | 4.155 | 4.009 |
| -1.282599999999967 | 12.275 | 4.145 | 4.015 |
| -1.278649999999967 | 12.25 | 4.135 | 4.02 |
| -1.274699999999967 | 12.224 | 4.125 | 4.026 |
| -1.270749999999967 | 12.198 | 4.115 | 4.032 |
| -1.266799999999967 | 12.172 | 4.105 | 4.038 |
| -1.262849999999968 | 12.146 | 4.095 | 4.043 |
| -1.258899999999968 | 12.12 | 4.085 | 4.049 |
| -1.254949999999968 | 12.095 | 4.075 | 4.055 |
| -1.250999999999968 | 12.069 | 4.065 | 4.061 |
| -1.247049999999968 | 12.043 | 4.055 | 4.067 |
| -1.243099999999968 | 12.018 | 4.045 | 4.073 |
| -1.239149999999968 | 11.992 | 4.035 | 4.079 |
| -1.235199999999968 | 11.967 | 4.026 | 4.085 |
| -1.231249999999968 | 11.941 | 4.016 | 4.091 |
| -1.227299999999969 | 11.915 | 4.006 | 4.097 |
| -1.223349999999969 | 11.89 | 3.997 | 4.103 |
| -1.219399999999969 | 11.865 | 3.987 | 4.109 |
| -1.215449999999969 | 11.839 | 3.977 | 4.116 |
| -1.211499999999969 | 11.814 | 3.968 | 4.122 |
| -1.207549999999969 | 11.788 | 3.958 | 4.128 |
| -1.203599999999969 | 11.763 | 3.949 | 4.134 |
| -1.199649999999969 | 11.738 | 3.939 | 4.141 |
| -1.195699999999969 | 11.712 | 3.93 | 4.147 |
| -1.191749999999969 | 11.687 | 3.92 | 4.153 |
| -1.18779999999997 | 11.662 | 3.911 | 4.16 |
| -1.18384999999997 | 11.637 | 3.902 | 4.166 |
| -1.17989999999997 | 11.612 | 3.892 | 4.173 |
| -1.17594999999997 | 11.587 | 3.883 | 4.179 |
| -1.17199999999997 | 11.562 | 3.874 | 4.186 |
| -1.16804999999997 | 11.537 | 3.864 | 4.192 |
| -1.16409999999997 | 11.512 | 3.855 | 4.199 |
| -1.16014999999997 | 11.487 | 3.846 | 4.205 |
| -1.15619999999997 | 11.462 | 3.837 | 4.212 |
| -1.15224999999997 | 11.437 | 3.828 | 4.219 |
| -1.148299999999971 | 11.412 | 3.819 | 4.225 |
| -1.144349999999971 | 11.387 | 3.81 | 4.232 |
| -1.140399999999971 | 11.362 | 3.801 | 4.239 |
| -1.136449999999971 | 11.337 | 3.792 | 4.246 |
| -1.132499999999971 | 11.313 | 3.783 | 4.253 |
| -1.128549999999971 | 11.288 | 3.774 | 4.259 |
| -1.124599999999971 | 11.263 | 3.765 | 4.266 |
| -1.120649999999971 | 11.238 | 3.756 | 4.273 |
| -1.116699999999971 | 11.214 | 3.747 | 4.28 |
| -1.112749999999971 | 11.189 | 3.738 | 4.287 |
| -1.108799999999972 | 11.165 | 3.729 | 4.294 |
| -1.104849999999972 | 11.14 | 3.721 | 4.301 |
| -1.100899999999972 | 11.116 | 3.712 | 4.308 |
| -1.096949999999972 | 11.091 | 3.703 | 4.315 |
| -1.092999999999972 | 11.067 | 3.695 | 4.323 |
| -1.089049999999972 | 11.042 | 3.686 | 4.33 |
| -1.085099999999972 | 11.018 | 3.677 | 4.337 |
| -1.081149999999972 | 10.993 | 3.669 | 4.344 |
| -1.077199999999972 | 10.969 | 3.66 | 4.352 |
| -1.073249999999972 | 10.945 | 3.652 | 4.359 |
| -1.069299999999973 | 10.921 | 3.643 | 4.366 |
| -1.065349999999973 | 10.896 | 3.635 | 4.374 |
| -1.061399999999973 | 10.872 | 3.627 | 4.381 |
| -1.057449999999973 | 10.848 | 3.618 | 4.388 |
| -1.053499999999973 | 10.824 | 3.61 | 4.396 |
| -1.049549999999973 | 10.8 | 3.602 | 4.403 |
| -1.045599999999973 | 10.776 | 3.593 | 4.411 |
| -1.041649999999973 | 10.752 | 3.585 | 4.418 |
| -1.037699999999973 | 10.728 | 3.577 | 4.426 |
| -1.033749999999974 | 10.704 | 3.569 | 4.434 |
| -1.029799999999974 | 10.68 | 3.56 | 4.441 |
| -1.025849999999974 | 10.656 | 3.552 | 4.449 |
| -1.021899999999974 | 10.632 | 3.544 | 4.457 |
| -1.017949999999974 | 10.608 | 3.536 | 4.464 |
| -1.013999999999974 | 10.584 | 3.528 | 4.472 |
| -1.010049999999974 | 10.56 | 3.52 | 4.48 |
| -1.006099999999974 | 10.537 | 3.512 | 4.488 |
| -1.002149999999974 | 10.513 | 3.504 | 4.496 |
| -0.998199999999974 | 10.489 | 3.496 | 4.504 |
| -0.994249999999974 | 10.466 | 3.489 | 4.512 |
| -0.990299999999974 | 10.442 | 3.481 | 4.519 |
| -0.986349999999974 | 10.418 | 3.473 | 4.527 |
| -0.982399999999974 | 10.395 | 3.465 | 4.536 |
| -0.978449999999974 | 10.371 | 3.457 | 4.544 |
| -0.974499999999974 | 10.348 | 3.45 | 4.552 |
| -0.970549999999974 | 10.324 | 3.442 | 4.56 |
| -0.966599999999974 | 10.301 | 3.434 | 4.568 |
| -0.962649999999974 | 10.277 | 3.427 | 4.576 |
| -0.958699999999974 | 10.254 | 3.419 | 4.584 |
| -0.954749999999974 | 10.231 | 3.412 | 4.593 |
| -0.950799999999974 | 10.207 | 3.404 | 4.601 |
| -0.946849999999974 | 10.184 | 3.397 | 4.609 |
| -0.942899999999974 | 10.161 | 3.389 | 4.617 |
| -0.938949999999974 | 10.137 | 3.382 | 4.626 |
| -0.934999999999974 | 10.114 | 3.374 | 4.634 |
| -0.931049999999974 | 10.091 | 3.367 | 4.643 |
| -0.927099999999974 | 10.068 | 3.36 | 4.651 |
| -0.923149999999974 | 10.045 | 3.352 | 4.66 |
| -0.919199999999974 | 10.022 | 3.345 | 4.668 |
| -0.915249999999974 | 9.999 | 3.338 | 4.677 |
| -0.911299999999974 | 9.976 | 3.33 | 4.685 |
| -0.907349999999974 | 9.953 | 3.323 | 4.694 |
| -0.903399999999974 | 9.93 | 3.316 | 4.703 |
| -0.899449999999974 | 9.907 | 3.309 | 4.711 |
| -0.895499999999974 | 9.884 | 3.302 | 4.72 |
| -0.891549999999974 | 9.861 | 3.295 | 4.729 |
| -0.887599999999974 | 9.838 | 3.288 | 4.737 |
| -0.883649999999974 | 9.815 | 3.281 | 4.746 |
| -0.879699999999974 | 9.793 | 3.274 | 4.755 |
| -0.875749999999974 | 9.77 | 3.267 | 4.764 |
| -0.871799999999974 | 9.747 | 3.26 | 4.773 |
| -0.867849999999974 | 9.725 | 3.253 | 4.782 |
| -0.863899999999974 | 9.702 | 3.246 | 4.791 |
| -0.859949999999974 | 9.679 | 3.24 | 4.8 |
| -0.855999999999974 | 9.657 | 3.233 | 4.809 |
| -0.852049999999974 | 9.634 | 3.226 | 4.818 |
| -0.848099999999974 | 9.612 | 3.219 | 4.827 |
| -0.844149999999974 | 9.589 | 3.213 | 4.836 |
| -0.840199999999974 | 9.567 | 3.206 | 4.845 |
| -0.836249999999974 | 9.544 | 3.199 | 4.854 |
| -0.832299999999974 | 9.522 | 3.193 | 4.864 |
| -0.828349999999974 | 9.5 | 3.186 | 4.873 |
| -0.824399999999974 | 9.477 | 3.18 | 4.882 |
| -0.820449999999974 | 9.455 | 3.173 | 4.891 |
| -0.816499999999974 | 9.433 | 3.167 | 4.901 |
| -0.812549999999974 | 9.41 | 3.16 | 4.91 |
| -0.808599999999974 | 9.388 | 3.154 | 4.919 |
| -0.804649999999974 | 9.366 | 3.147 | 4.929 |
| -0.800699999999974 | 9.344 | 3.141 | 4.938 |
| -0.796749999999974 | 9.322 | 3.135 | 4.948 |
| -0.792799999999974 | 9.3 | 3.129 | 4.957 |
| -0.788849999999974 | 9.278 | 3.122 | 4.967 |
| -0.784899999999974 | 9.256 | 3.116 | 4.976 |
| -0.780949999999974 | 9.234 | 3.11 | 4.986 |
| -0.776999999999974 | 9.212 | 3.104 | 4.996 |
| -0.773049999999974 | 9.19 | 3.098 | 5.005 |
| -0.769099999999974 | 9.168 | 3.092 | 5.015 |
| -0.765149999999974 | 9.146 | 3.085 | 5.025 |
| -0.761199999999974 | 9.124 | 3.079 | 5.035 |
| -0.757249999999974 | 9.102 | 3.073 | 5.044 |
| -0.753299999999974 | 9.081 | 3.067 | 5.054 |
| -0.749349999999974 | 9.059 | 3.062 | 5.064 |
| -0.745399999999974 | 9.037 | 3.056 | 5.074 |
| -0.741449999999974 | 9.016 | 3.05 | 5.084 |
| -0.737499999999974 | 8.994 | 3.044 | 5.094 |
| -0.733549999999974 | 8.972 | 3.038 | 5.104 |
| -0.729599999999974 | 8.951 | 3.032 | 5.114 |
| -0.725649999999974 | 8.929 | 3.027 | 5.124 |
| -0.721699999999974 | 8.908 | 3.021 | 5.134 |
| -0.717749999999974 | 8.886 | 3.015 | 5.144 |
| -0.713799999999974 | 8.865 | 3.01 | 5.154 |
| -0.709849999999974 | 8.843 | 3.004 | 5.164 |
| -0.705899999999974 | 8.822 | 2.998 | 5.175 |
| -0.701949999999974 | 8.801 | 2.993 | 5.185 |
| -0.697999999999974 | 8.779 | 2.987 | 5.195 |
| -0.694049999999974 | 8.758 | 2.982 | 5.206 |
| -0.690099999999974 | 8.737 | 2.976 | 5.216 |
| -0.686149999999974 | 8.715 | 2.971 | 5.226 |
| -0.682199999999974 | 8.694 | 2.965 | 5.237 |
| -0.678249999999973 | 8.673 | 2.96 | 5.247 |
| -0.674299999999973 | 8.652 | 2.955 | 5.257 |
| -0.670349999999973 | 8.631 | 2.949 | 5.268 |
| -0.666399999999973 | 8.61 | 2.944 | 5.278 |
| -0.662449999999973 | 8.589 | 2.939 | 5.289 |
| -0.658499999999973 | 8.568 | 2.934 | 5.3 |
| -0.654549999999973 | 8.547 | 2.928 | 5.31 |
| -0.650599999999973 | 8.526 | 2.923 | 5.321 |
| -0.646649999999973 | 8.505 | 2.918 | 5.332 |
| -0.642699999999973 | 8.484 | 2.913 | 5.342 |
| -0.638749999999973 | 8.463 | 2.908 | 5.353 |
| -0.634799999999973 | 8.442 | 2.903 | 5.364 |
| -0.630849999999973 | 8.421 | 2.898 | 5.375 |
| -0.626899999999973 | 8.401 | 2.893 | 5.385 |
| -0.622949999999973 | 8.38 | 2.888 | 5.396 |
| -0.618999999999973 | 8.359 | 2.883 | 5.407 |
| -0.615049999999973 | 8.338 | 2.878 | 5.418 |
| -0.611099999999973 | 8.318 | 2.873 | 5.429 |
| -0.607149999999973 | 8.297 | 2.869 | 5.44 |
| -0.603199999999973 | 8.277 | 2.864 | 5.451 |
| -0.599249999999973 | 8.256 | 2.859 | 5.462 |
| -0.595299999999973 | 8.236 | 2.854 | 5.473 |
| -0.591349999999973 | 8.215 | 2.85 | 5.484 |
| -0.587399999999973 | 8.195 | 2.845 | 5.495 |
| -0.583449999999973 | 8.174 | 2.84 | 5.507 |
| -0.579499999999973 | 8.154 | 2.836 | 5.518 |
| -0.575549999999973 | 8.133 | 2.831 | 5.529 |
| -0.571599999999973 | 8.113 | 2.827 | 5.54 |
| -0.567649999999973 | 8.093 | 2.822 | 5.552 |
| -0.563699999999973 | 8.073 | 2.818 | 5.563 |
| -0.559749999999973 | 8.052 | 2.813 | 5.574 |
| -0.555799999999973 | 8.032 | 2.809 | 5.586 |
| -0.551849999999973 | 8.012 | 2.805 | 5.597 |
| -0.547899999999973 | 7.992 | 2.8 | 5.609 |
| -0.543949999999973 | 7.972 | 2.796 | 5.62 |
| -0.539999999999973 | 7.952 | 2.792 | 5.632 |
| -0.536049999999973 | 7.932 | 2.787 | 5.643 |
| -0.532099999999973 | 7.912 | 2.783 | 5.655 |
| -0.528149999999973 | 7.892 | 2.779 | 5.666 |
| -0.524199999999973 | 7.872 | 2.775 | 5.678 |
| -0.520249999999973 | 7.852 | 2.771 | 5.69 |
| -0.516299999999973 | 7.832 | 2.767 | 5.701 |
| -0.512349999999973 | 7.812 | 2.763 | 5.713 |
| -0.508399999999973 | 7.792 | 2.758 | 5.725 |
| -0.504449999999973 | 7.772 | 2.754 | 5.737 |
| -0.500499999999973 | 7.753 | 2.751 | 5.749 |
| -0.496549999999973 | 7.733 | 2.747 | 5.76 |
| -0.492599999999973 | 7.713 | 2.743 | 5.772 |
| -0.488649999999973 | 7.693 | 2.739 | 5.784 |
| -0.484699999999973 | 7.674 | 2.735 | 5.796 |
| -0.480749999999973 | 7.654 | 2.731 | 5.808 |
| -0.476799999999973 | 7.635 | 2.727 | 5.82 |
| -0.472849999999973 | 7.615 | 2.724 | 5.832 |
| -0.468899999999973 | 7.595 | 2.72 | 5.844 |
| -0.464949999999973 | 7.576 | 2.716 | 5.856 |
| -0.460999999999973 | 7.557 | 2.713 | 5.869 |
| -0.457049999999973 | 7.537 | 2.709 | 5.881 |
| -0.453099999999973 | 7.518 | 2.705 | 5.893 |
| -0.449149999999973 | 7.498 | 2.702 | 5.905 |
| -0.445199999999973 | 7.479 | 2.698 | 5.917 |
| -0.441249999999973 | 7.46 | 2.695 | 5.93 |
| -0.437299999999973 | 7.44 | 2.691 | 5.942 |
| -0.433349999999973 | 7.421 | 2.688 | 5.954 |
| -0.429399999999973 | 7.402 | 2.684 | 5.967 |
| -0.425449999999973 | 7.383 | 2.681 | 5.979 |
| -0.421499999999973 | 7.364 | 2.678 | 5.992 |
| -0.417549999999973 | 7.345 | 2.674 | 6.004 |
| -0.413599999999973 | 7.325 | 2.671 | 6.017 |
| -0.409649999999973 | 7.306 | 2.668 | 6.029 |
| -0.405699999999973 | 7.287 | 2.665 | 6.042 |
| -0.401749999999973 | 7.268 | 2.661 | 6.054 |
| -0.397799999999973 | 7.249 | 2.658 | 6.067 |
| -0.393849999999973 | 7.231 | 2.655 | 6.08 |
| -0.389899999999973 | 7.212 | 2.652 | 6.092 |
| -0.385949999999973 | 7.193 | 2.649 | 6.105 |
| -0.381999999999973 | 7.174 | 2.646 | 6.118 |
| -0.378049999999973 | 7.155 | 2.643 | 6.131 |
| -0.374099999999973 | 7.136 | 2.64 | 6.144 |
| -0.370149999999973 | 7.118 | 2.637 | 6.156 |
| -0.366199999999973 | 7.099 | 2.634 | 6.169 |
| -0.362249999999973 | 7.08 | 2.631 | 6.182 |
| -0.358299999999973 | 7.062 | 2.628 | 6.195 |
| -0.354349999999973 | 7.043 | 2.626 | 6.208 |
| -0.350399999999973 | 7.024 | 2.623 | 6.221 |
| -0.346449999999973 | 7.006 | 2.62 | 6.234 |
| -0.342499999999973 | 6.987 | 2.617 | 6.247 |
| -0.338549999999973 | 6.969 | 2.615 | 6.26 |
| -0.334599999999973 | 6.95 | 2.612 | 6.274 |
| -0.330649999999973 | 6.932 | 2.609 | 6.287 |
| -0.326699999999973 | 6.914 | 2.607 | 6.3 |
| -0.322749999999973 | 6.895 | 2.604 | 6.313 |
| -0.318799999999973 | 6.877 | 2.602 | 6.326 |
| -0.314849999999973 | 6.859 | 2.599 | 6.34 |
| -0.310899999999973 | 6.84 | 2.597 | 6.353 |
| -0.306949999999973 | 6.822 | 2.594 | 6.366 |
| -0.302999999999973 | 6.804 | 2.592 | 6.38 |
| -0.299049999999973 | 6.786 | 2.589 | 6.393 |
| -0.295099999999973 | 6.767 | 2.587 | 6.407 |
| -0.291149999999973 | 6.749 | 2.585 | 6.42 |
| -0.287199999999973 | 6.731 | 2.582 | 6.434 |
| -0.283249999999973 | 6.713 | 2.58 | 6.447 |
| -0.279299999999973 | 6.695 | 2.578 | 6.461 |
| -0.275349999999973 | 6.677 | 2.576 | 6.474 |
| -0.271399999999973 | 6.659 | 2.574 | 6.488 |
| -0.267449999999973 | 6.641 | 2.572 | 6.502 |
| -0.263499999999973 | 6.623 | 2.569 | 6.515 |
| -0.259549999999973 | 6.606 | 2.567 | 6.529 |
| -0.255599999999973 | 6.588 | 2.565 | 6.543 |
| -0.251649999999973 | 6.57 | 2.563 | 6.557 |
| -0.247699999999973 | 6.552 | 2.561 | 6.571 |
| -0.243749999999973 | 6.534 | 2.559 | 6.584 |
| -0.239799999999973 | 6.517 | 2.558 | 6.598 |
| -0.235849999999973 | 6.499 | 2.556 | 6.612 |
| -0.231899999999973 | 6.481 | 2.554 | 6.626 |
| -0.227949999999973 | 6.464 | 2.552 | 6.64 |
| -0.223999999999973 | 6.446 | 2.55 | 6.654 |
| -0.220049999999973 | 6.429 | 2.548 | 6.668 |
| -0.216099999999973 | 6.411 | 2.547 | 6.682 |
| -0.212149999999973 | 6.394 | 2.545 | 6.696 |
| -0.208199999999973 | 6.376 | 2.543 | 6.711 |
| -0.204249999999972 | 6.359 | 2.542 | 6.725 |
| -0.200299999999972 | 6.341 | 2.54 | 6.739 |
| -0.196349999999972 | 6.324 | 2.539 | 6.753 |
| -0.192399999999972 | 6.307 | 2.537 | 6.767 |
| -0.188449999999972 | 6.289 | 2.536 | 6.782 |
| -0.184499999999972 | 6.272 | 2.534 | 6.796 |
| -0.180549999999972 | 6.255 | 2.533 | 6.81 |
| -0.176599999999972 | 6.238 | 2.531 | 6.825 |
| -0.172649999999972 | 6.22 | 2.53 | 6.839 |
| -0.168699999999972 | 6.203 | 2.528 | 6.854 |
| -0.164749999999972 | 6.186 | 2.527 | 6.868 |
| -0.160799999999972 | 6.169 | 2.526 | 6.883 |
| -0.156849999999972 | 6.152 | 2.525 | 6.897 |
| -0.152899999999972 | 6.135 | 2.523 | 6.912 |
| -0.148949999999972 | 6.118 | 2.522 | 6.926 |
| -0.144999999999972 | 6.101 | 2.521 | 6.941 |
| -0.141049999999972 | 6.084 | 2.52 | 6.956 |
| -0.137099999999972 | 6.067 | 2.519 | 6.97 |
| -0.133149999999972 | 6.05 | 2.518 | 6.985 |
| -0.129199999999972 | 6.033 | 2.517 | 7 |
| -0.125249999999972 | 6.017 | 2.516 | 7.015 |
| -0.121299999999972 | 6 | 2.515 | 7.03 |
| -0.117349999999972 | 5.983 | 2.514 | 7.044 |
| -0.113399999999972 | 5.966 | 2.513 | 7.059 |
| -0.109449999999972 | 5.95 | 2.512 | 7.074 |
| -0.105499999999972 | 5.933 | 2.511 | 7.089 |
| -0.101549999999972 | 5.917 | 2.51 | 7.104 |
| -0.0975999999999723 | 5.9 | 2.51 | 7.119 |
| -0.0936499999999723 | 5.883 | 2.509 | 7.134 |
| -0.0896999999999724 | 5.867 | 2.508 | 7.149 |
| -0.0857499999999724 | 5.85 | 2.507 | 7.164 |
| -0.0817999999999724 | 5.834 | 2.507 | 7.179 |
| -0.0778499999999724 | 5.817 | 2.506 | 7.195 |
| -0.0738999999999724 | 5.801 | 2.505 | 7.21 |
| -0.0699499999999724 | 5.785 | 2.505 | 7.225 |
| -0.0659999999999724 | 5.768 | 2.504 | 7.24 |
| -0.0620499999999724 | 5.752 | 2.504 | 7.256 |
| -0.0580999999999724 | 5.736 | 2.503 | 7.271 |
| -0.0541499999999724 | 5.72 | 2.503 | 7.286 |
| -0.0501999999999724 | 5.703 | 2.503 | 7.302 |
| -0.0462499999999724 | 5.687 | 2.502 | 7.317 |
| -0.0422999999999724 | 5.671 | 2.502 | 7.333 |
| -0.0383499999999724 | 5.655 | 2.501 | 7.348 |
| -0.0343999999999724 | 5.639 | 2.501 | 7.364 |
| -0.0304499999999724 | 5.623 | 2.501 | 7.379 |
| -0.0264999999999724 | 5.607 | 2.501 | 7.395 |
| -0.0225499999999724 | 5.591 | 2.501 | 7.41 |
| -0.0185999999999724 | 5.575 | 2.5 | 7.426 |
| -0.0146499999999724 | 5.559 | 2.5 | 7.442 |
| -0.0106999999999724 | 5.543 | 2.5 | 7.457 |
| -0.00674999999997237 | 5.527 | 2.5 | 7.473 |
| -0.00279999999997237 | 5.511 | 2.5 | 7.489 |
| 0.00115000000002763 | 5.495 | 2.5 | 7.505 |
| 0.00510000000002763 | 5.48 | 2.5 | 7.52 |
| 0.00905000000002763 | 5.464 | 2.5 | 7.536 |
| 0.0130000000000276 | 5.448 | 2.5 | 7.552 |
| 0.0169500000000276 | 5.432 | 2.5 | 7.568 |
| 0.0209000000000276 | 5.417 | 2.5 | 7.584 |
| 0.0248500000000276 | 5.401 | 2.501 | 7.6 |
| 0.0288000000000276 | 5.386 | 2.501 | 7.616 |
| 0.0327500000000276 | 5.37 | 2.501 | 7.632 |
| 0.0367000000000276 | 5.355 | 2.501 | 7.648 |
| 0.0406500000000276 | 5.339 | 2.502 | 7.664 |
| 0.0446000000000276 | 5.324 | 2.502 | 7.68 |
| 0.0485500000000276 | 5.308 | 2.502 | 7.697 |
| 0.0525000000000276 | 5.293 | 2.503 | 7.713 |
| 0.0564500000000276 | 5.277 | 2.503 | 7.729 |
| 0.0604000000000276 | 5.262 | 2.504 | 7.745 |
| 0.0643500000000276 | 5.247 | 2.504 | 7.762 |
| 0.0683000000000276 | 5.231 | 2.505 | 7.778 |
| 0.0722500000000276 | 5.216 | 2.505 | 7.794 |
| 0.0762000000000276 | 5.201 | 2.506 | 7.811 |
| 0.0801500000000276 | 5.186 | 2.506 | 7.827 |
| 0.0841000000000276 | 5.171 | 2.507 | 7.843 |
| 0.0880500000000276 | 5.156 | 2.508 | 7.86 |
| 0.0920000000000276 | 5.14 | 2.508 | 7.876 |
| 0.0959500000000276 | 5.125 | 2.509 | 7.893 |
| 0.0999000000000276 | 5.11 | 2.51 | 7.91 |
| 0.103850000000028 | 5.095 | 2.511 | 7.926 |
| 0.107800000000028 | 5.08 | 2.512 | 7.943 |
| 0.111750000000028 | 5.065 | 2.512 | 7.959 |
| 0.115700000000028 | 5.051 | 2.513 | 7.976 |
| 0.119650000000028 | 5.036 | 2.514 | 7.993 |
| 0.123600000000028 | 5.021 | 2.515 | 8.01 |
| 0.127550000000028 | 5.006 | 2.516 | 8.026 |
| 0.131500000000028 | 4.991 | 2.517 | 8.043 |
| 0.135450000000028 | 4.977 | 2.518 | 8.06 |
| 0.139400000000028 | 4.962 | 2.519 | 8.077 |
| 0.143350000000028 | 4.947 | 2.521 | 8.094 |
| 0.147300000000028 | 4.932 | 2.522 | 8.111 |
| 0.151250000000028 | 4.918 | 2.523 | 8.128 |
| 0.155200000000028 | 4.903 | 2.524 | 8.145 |
| 0.159150000000028 | 4.889 | 2.525 | 8.162 |
| 0.163100000000028 | 4.874 | 2.527 | 8.179 |
| 0.167050000000028 | 4.86 | 2.528 | 8.196 |
| 0.171000000000028 | 4.845 | 2.529 | 8.213 |
| 0.174950000000028 | 4.831 | 2.531 | 8.23 |
| 0.178900000000028 | 4.816 | 2.532 | 8.248 |
| 0.182850000000028 | 4.802 | 2.533 | 8.265 |
| 0.186800000000028 | 4.788 | 2.535 | 8.282 |
| 0.190750000000028 | 4.773 | 2.536 | 8.299 |
| 0.194700000000028 | 4.759 | 2.538 | 8.317 |
| 0.198650000000028 | 4.745 | 2.539 | 8.334 |
| 0.202600000000028 | 4.731 | 2.541 | 8.351 |
| 0.206550000000028 | 4.716 | 2.543 | 8.369 |
| 0.210500000000028 | 4.702 | 2.544 | 8.386 |
| 0.214450000000028 | 4.688 | 2.546 | 8.404 |
| 0.218400000000028 | 4.674 | 2.548 | 8.421 |
| 0.222350000000028 | 4.66 | 2.549 | 8.439 |
| 0.226300000000028 | 4.646 | 2.551 | 8.456 |
| 0.230250000000028 | 4.632 | 2.553 | 8.474 |
| 0.234200000000028 | 4.618 | 2.555 | 8.492 |
| 0.238150000000028 | 4.604 | 2.557 | 8.509 |
| 0.242100000000028 | 4.59 | 2.559 | 8.527 |
| 0.246050000000028 | 4.576 | 2.561 | 8.545 |
| 0.250000000000028 | 4.562 | 2.563 | 8.563 |
| 0.253950000000028 | 4.549 | 2.564 | 8.58 |
| 0.257900000000028 | 4.535 | 2.567 | 8.598 |
| 0.261850000000028 | 4.521 | 2.569 | 8.616 |
| 0.265800000000028 | 4.507 | 2.571 | 8.634 |
| 0.269750000000028 | 4.494 | 2.573 | 8.652 |
| 0.273700000000028 | 4.48 | 2.575 | 8.67 |
| 0.277650000000028 | 4.466 | 2.577 | 8.688 |
| 0.281600000000028 | 4.453 | 2.579 | 8.706 |
| 0.285550000000028 | 4.439 | 2.582 | 8.724 |
| 0.289500000000028 | 4.426 | 2.584 | 8.742 |
| 0.293450000000028 | 4.412 | 2.586 | 8.76 |
| 0.297400000000028 | 4.399 | 2.588 | 8.778 |
| 0.301350000000028 | 4.385 | 2.591 | 8.796 |
| 0.305300000000028 | 4.372 | 2.593 | 8.814 |
| 0.309250000000028 | 4.359 | 2.596 | 8.833 |
| 0.313200000000028 | 4.345 | 2.598 | 8.851 |
| 0.317150000000028 | 4.332 | 2.601 | 8.869 |
| 0.321100000000028 | 4.319 | 2.603 | 8.888 |
| 0.325050000000028 | 4.305 | 2.606 | 8.906 |
| 0.329000000000028 | 4.292 | 2.608 | 8.924 |
| 0.332950000000028 | 4.279 | 2.611 | 8.943 |
| 0.336900000000028 | 4.266 | 2.614 | 8.961 |
| 0.340850000000028 | 4.253 | 2.616 | 8.98 |
| 0.344800000000028 | 4.24 | 2.619 | 8.998 |
| 0.348750000000028 | 4.227 | 2.622 | 9.017 |
| 0.352700000000028 | 4.214 | 2.624 | 9.035 |
| 0.356650000000028 | 4.201 | 2.627 | 9.054 |
| 0.360600000000028 | 4.188 | 2.63 | 9.072 |
| 0.364550000000028 | 4.175 | 2.633 | 9.091 |
| 0.368500000000028 | 4.162 | 2.636 | 9.11 |
| 0.372450000000028 | 4.149 | 2.639 | 9.129 |
| 0.376400000000028 | 4.136 | 2.642 | 9.147 |
| 0.380350000000028 | 4.123 | 2.645 | 9.166 |
| 0.384300000000028 | 4.11 | 2.648 | 9.185 |
| 0.388250000000028 | 4.098 | 2.651 | 9.204 |
| 0.392200000000028 | 4.085 | 2.654 | 9.223 |
| 0.396150000000028 | 4.072 | 2.657 | 9.242 |
| 0.400100000000028 | 4.06 | 2.66 | 9.26 |
| 0.404050000000028 | 4.047 | 2.663 | 9.279 |
| 0.408000000000028 | 4.034 | 2.666 | 9.298 |
| 0.411950000000028 | 4.022 | 2.67 | 9.318 |
| 0.415900000000028 | 4.009 | 2.673 | 9.337 |
| 0.419850000000028 | 3.997 | 2.676 | 9.356 |
| 0.423800000000028 | 3.984 | 2.68 | 9.375 |
| 0.427750000000028 | 3.972 | 2.683 | 9.394 |
| 0.431700000000028 | 3.96 | 2.686 | 9.413 |
| 0.435650000000028 | 3.947 | 2.69 | 9.432 |
| 0.439600000000028 | 3.935 | 2.693 | 9.452 |
| 0.443550000000028 | 3.923 | 2.697 | 9.471 |
| 0.447500000000028 | 3.91 | 2.7 | 9.49 |
| 0.451450000000028 | 3.898 | 2.704 | 9.51 |
| 0.455400000000028 | 3.886 | 2.707 | 9.529 |
| 0.459350000000028 | 3.874 | 2.711 | 9.548 |
| 0.463300000000028 | 3.861 | 2.715 | 9.568 |
| 0.467250000000028 | 3.849 | 2.718 | 9.587 |
| 0.471200000000028 | 3.837 | 2.722 | 9.607 |
| 0.475150000000028 | 3.825 | 2.726 | 9.626 |
| 0.479100000000028 | 3.813 | 2.73 | 9.646 |
| 0.483050000000028 | 3.801 | 2.733 | 9.666 |
| 0.487000000000028 | 3.789 | 2.737 | 9.685 |
| 0.490950000000028 | 3.777 | 2.741 | 9.705 |
| 0.494900000000028 | 3.765 | 2.745 | 9.725 |
| 0.498850000000028 | 3.753 | 2.749 | 9.744 |
| 0.502800000000028 | 3.742 | 2.753 | 9.764 |
| 0.506750000000028 | 3.73 | 2.757 | 9.784 |
| 0.510700000000028 | 3.718 | 2.761 | 9.804 |
| 0.514650000000028 | 3.706 | 2.765 | 9.823 |
| 0.518600000000028 | 3.695 | 2.769 | 9.843 |
| 0.522550000000028 | 3.683 | 2.773 | 9.863 |
| 0.526500000000028 | 3.671 | 2.777 | 9.883 |
| 0.530450000000029 | 3.66 | 2.781 | 9.903 |
| 0.534400000000029 | 3.648 | 2.786 | 9.923 |
| 0.538350000000029 | 3.636 | 2.79 | 9.943 |
| 0.542300000000029 | 3.625 | 2.794 | 9.963 |
| 0.546250000000029 | 3.613 | 2.798 | 9.983 |
| 0.550200000000029 | 3.602 | 2.803 | 10.004 |
| 0.554150000000029 | 3.59 | 2.807 | 10.024 |
| 0.558100000000029 | 3.579 | 2.811 | 10.044 |
| 0.562050000000029 | 3.568 | 2.816 | 10.064 |
| 0.566000000000029 | 3.556 | 2.82 | 10.084 |
| 0.569950000000029 | 3.545 | 2.825 | 10.105 |
| 0.573900000000029 | 3.534 | 2.829 | 10.125 |
| 0.577850000000029 | 3.523 | 2.834 | 10.145 |
| 0.581800000000029 | 3.511 | 2.838 | 10.166 |
| 0.585750000000029 | 3.5 | 2.843 | 10.186 |
| 0.589700000000029 | 3.489 | 2.848 | 10.207 |
| 0.593650000000029 | 3.478 | 2.852 | 10.227 |
| 0.597600000000029 | 3.467 | 2.857 | 10.248 |
| 0.601550000000029 | 3.456 | 2.862 | 10.268 |
| 0.605500000000029 | 3.445 | 2.867 | 10.289 |
| 0.609450000000029 | 3.434 | 2.871 | 10.309 |
| 0.613400000000029 | 3.423 | 2.876 | 10.33 |
| 0.617350000000029 | 3.412 | 2.881 | 10.351 |
| 0.621300000000029 | 3.401 | 2.886 | 10.371 |
| 0.625250000000029 | 3.39 | 2.891 | 10.392 |
| 0.629200000000029 | 3.379 | 2.896 | 10.413 |
| 0.633150000000029 | 3.368 | 2.901 | 10.433 |
| 0.637100000000029 | 3.357 | 2.906 | 10.454 |
| 0.641050000000029 | 3.347 | 2.911 | 10.475 |
| 0.645000000000029 | 3.336 | 2.916 | 10.496 |
| 0.648950000000029 | 3.325 | 2.921 | 10.517 |
| 0.652900000000029 | 3.315 | 2.926 | 10.538 |
| 0.656850000000029 | 3.304 | 2.931 | 10.559 |
| 0.660800000000029 | 3.293 | 2.937 | 10.58 |
| 0.664750000000029 | 3.283 | 2.942 | 10.601 |
| 0.668700000000029 | 3.272 | 2.947 | 10.622 |
| 0.672650000000029 | 3.262 | 2.952 | 10.643 |
| 0.676600000000029 | 3.251 | 2.958 | 10.664 |
| 0.680550000000029 | 3.241 | 2.963 | 10.685 |
| 0.684500000000029 | 3.231 | 2.969 | 10.707 |
| 0.688450000000029 | 3.22 | 2.974 | 10.728 |
| 0.692400000000029 | 3.21 | 2.979 | 10.749 |
| 0.696350000000029 | 3.2 | 2.985 | 10.77 |
| 0.700300000000029 | 3.189 | 2.99 | 10.792 |
| 0.704250000000029 | 3.179 | 2.996 | 10.813 |
| 0.708200000000029 | 3.169 | 3.002 | 10.834 |
| 0.712150000000029 | 3.159 | 3.007 | 10.856 |
| 0.716100000000029 | 3.148 | 3.013 | 10.877 |
| 0.720050000000029 | 3.138 | 3.018 | 10.899 |
| 0.724000000000029 | 3.128 | 3.024 | 10.92 |
| 0.727950000000029 | 3.118 | 3.03 | 10.942 |
| 0.731900000000029 | 3.108 | 3.036 | 10.963 |
| 0.735850000000029 | 3.098 | 3.041 | 10.985 |
| 0.739800000000029 | 3.088 | 3.047 | 11.007 |
| 0.743750000000029 | 3.078 | 3.053 | 11.028 |
| 0.747700000000029 | 3.068 | 3.059 | 11.05 |
| 0.751650000000029 | 3.058 | 3.065 | 11.072 |
| 0.755600000000029 | 3.049 | 3.071 | 11.093 |
| 0.759550000000029 | 3.039 | 3.077 | 11.115 |
| 0.763500000000029 | 3.029 | 3.083 | 11.137 |
| 0.767450000000029 | 3.019 | 3.089 | 11.159 |
| 0.771400000000029 | 3.009 | 3.095 | 11.181 |
| 0.775350000000029 | 3 | 3.101 | 11.203 |
| 0.779300000000029 | 2.99 | 3.107 | 11.225 |
| 0.783250000000029 | 2.98 | 3.113 | 11.246 |
| 0.787200000000029 | 2.971 | 3.12 | 11.268 |
| 0.791150000000029 | 2.961 | 3.126 | 11.291 |
| 0.795100000000029 | 2.952 | 3.132 | 11.313 |
| 0.799050000000029 | 2.942 | 3.138 | 11.335 |
| 0.803000000000029 | 2.933 | 3.145 | 11.357 |
| 0.806950000000029 | 2.923 | 3.151 | 11.379 |
| 0.810900000000029 | 2.914 | 3.158 | 11.401 |
| 0.814850000000029 | 2.905 | 3.164 | 11.423 |
| 0.818800000000029 | 2.895 | 3.17 | 11.446 |
| 0.822750000000029 | 2.886 | 3.177 | 11.468 |
| 0.826700000000029 | 2.877 | 3.183 | 11.49 |
| 0.830650000000029 | 2.867 | 3.19 | 11.513 |
| 0.834600000000029 | 2.858 | 3.197 | 11.535 |
| 0.838550000000029 | 2.849 | 3.203 | 11.557 |
| 0.842500000000029 | 2.84 | 3.21 | 11.58 |
| 0.846450000000029 | 2.831 | 3.216 | 11.602 |
| 0.850400000000029 | 2.822 | 3.223 | 11.625 |
| 0.854350000000029 | 2.813 | 3.23 | 11.647 |
| 0.858300000000029 | 2.803 | 3.237 | 11.67 |
| 0.862250000000029 | 2.794 | 3.243 | 11.692 |
| 0.866200000000029 | 2.786 | 3.25 | 11.715 |
| 0.870150000000029 | 2.777 | 3.257 | 11.738 |
| 0.874100000000029 | 2.768 | 3.264 | 11.76 |
| 0.878050000000029 | 2.759 | 3.271 | 11.783 |
| 0.882000000000029 | 2.75 | 3.278 | 11.806 |
| 0.885950000000029 | 2.741 | 3.285 | 11.829 |
| 0.889900000000029 | 2.732 | 3.292 | 11.852 |
| 0.893850000000029 | 2.724 | 3.299 | 11.874 |
| 0.897800000000029 | 2.715 | 3.306 | 11.897 |
| 0.901750000000029 | 2.706 | 3.313 | 11.92 |
| 0.905700000000029 | 2.697 | 3.32 | 11.943 |
| 0.909650000000029 | 2.689 | 3.327 | 11.966 |
| 0.913600000000029 | 2.68 | 3.335 | 11.989 |
| 0.917550000000029 | 2.672 | 3.342 | 12.012 |
| 0.921500000000029 | 2.663 | 3.349 | 12.035 |
| 0.925450000000029 | 2.655 | 3.356 | 12.058 |
| 0.929400000000029 | 2.646 | 3.364 | 12.081 |
| 0.933350000000029 | 2.638 | 3.371 | 12.105 |
| 0.937300000000029 | 2.629 | 3.379 | 12.128 |
| 0.941250000000029 | 2.621 | 3.386 | 12.151 |
| 0.945200000000029 | 2.613 | 3.393 | 12.174 |
| 0.949150000000029 | 2.604 | 3.401 | 12.197 |
| 0.953100000000029 | 2.596 | 3.408 | 12.221 |
| 0.957050000000029 | 2.588 | 3.416 | 12.244 |
| 0.961000000000029 | 2.58 | 3.424 | 12.268 |
| 0.964950000000029 | 2.571 | 3.431 | 12.291 |
| 0.968900000000029 | 2.563 | 3.439 | 12.314 |
| 0.972850000000029 | 2.555 | 3.446 | 12.338 |
| 0.97680000000003 | 2.547 | 3.454 | 12.361 |
| 0.98075000000003 | 2.539 | 3.462 | 12.385 |
| 0.98470000000003 | 2.531 | 3.47 | 12.408 |
| 0.98865000000003 | 2.523 | 3.477 | 12.432 |
| 0.99260000000003 | 2.515 | 3.485 | 12.456 |
| 0.99655000000003 | 2.507 | 3.493 | 12.479 |
| 1.000500000000029 | 2.499 | 3.501 | 12.503 |
| 1.004450000000029 | 2.491 | 3.509 | 12.527 |
| 1.008400000000029 | 2.483 | 3.517 | 12.55 |
| 1.01235000000003 | 2.475 | 3.525 | 12.574 |
| 1.01630000000003 | 2.468 | 3.533 | 12.598 |
| 1.020250000000029 | 2.46 | 3.541 | 12.622 |
| 1.024200000000029 | 2.452 | 3.549 | 12.646 |
| 1.028150000000029 | 2.444 | 3.557 | 12.67 |
| 1.032100000000029 | 2.437 | 3.565 | 12.694 |
| 1.036050000000029 | 2.429 | 3.573 | 12.718 |
| 1.040000000000028 | 2.422 | 3.582 | 12.742 |
| 1.043950000000028 | 2.414 | 3.59 | 12.766 |
| 1.047900000000028 | 2.406 | 3.598 | 12.79 |
| 1.051850000000028 | 2.399 | 3.606 | 12.814 |
| 1.055800000000028 | 2.392 | 3.615 | 12.838 |
| 1.059750000000028 | 2.384 | 3.623 | 12.862 |
| 1.063700000000028 | 2.377 | 3.631 | 12.886 |
| 1.067650000000028 | 2.369 | 3.64 | 12.91 |
| 1.071600000000028 | 2.362 | 3.648 | 12.935 |
| 1.075550000000028 | 2.355 | 3.657 | 12.959 |
| 1.079500000000027 | 2.347 | 3.665 | 12.983 |
| 1.083450000000027 | 2.34 | 3.674 | 13.008 |
| 1.087400000000027 | 2.333 | 3.682 | 13.032 |
| 1.091350000000027 | 2.326 | 3.691 | 13.056 |
| 1.095300000000027 | 2.318 | 3.7 | 13.081 |
| 1.099250000000027 | 2.311 | 3.708 | 13.105 |
| 1.103200000000027 | 2.304 | 3.717 | 13.13 |
| 1.107150000000027 | 2.297 | 3.726 | 13.154 |
| 1.111100000000027 | 2.29 | 3.735 | 13.179 |
| 1.115050000000027 | 2.283 | 3.743 | 13.204 |
| 1.119000000000026 | 2.276 | 3.752 | 13.228 |
| 1.122950000000026 | 2.269 | 3.761 | 13.253 |
| 1.126900000000026 | 2.262 | 3.77 | 13.278 |
| 1.130850000000026 | 2.255 | 3.779 | 13.302 |
| 1.134800000000026 | 2.249 | 3.788 | 13.327 |
| 1.138750000000026 | 2.242 | 3.797 | 13.352 |
| 1.142700000000026 | 2.235 | 3.806 | 13.377 |
| 1.146650000000026 | 2.228 | 3.815 | 13.401 |
| 1.150600000000026 | 2.221 | 3.824 | 13.426 |
| 1.154550000000025 | 2.215 | 3.833 | 13.451 |
| 1.158500000000025 | 2.208 | 3.842 | 13.476 |
| 1.162450000000025 | 2.201 | 3.851 | 13.501 |
| 1.166400000000025 | 2.195 | 3.86 | 13.526 |
| 1.170350000000025 | 2.188 | 3.87 | 13.551 |
| 1.174300000000025 | 2.182 | 3.879 | 13.576 |
| 1.178250000000025 | 2.175 | 3.888 | 13.601 |
| 1.182200000000025 | 2.169 | 3.898 | 13.626 |
| 1.186150000000025 | 2.162 | 3.907 | 13.652 |
| 1.190100000000025 | 2.156 | 3.916 | 13.677 |
| 1.194050000000024 | 2.15 | 3.926 | 13.702 |
| 1.198000000000024 | 2.143 | 3.935 | 13.727 |
| 1.201950000000024 | 2.137 | 3.945 | 13.752 |
| 1.205900000000024 | 2.131 | 3.954 | 13.778 |
| 1.209850000000024 | 2.124 | 3.964 | 13.803 |
| 1.213800000000024 | 2.118 | 3.973 | 13.829 |
| 1.217750000000024 | 2.112 | 3.983 | 13.854 |
| 1.221700000000024 | 2.106 | 3.993 | 13.879 |
| 1.225650000000024 | 2.1 | 4.002 | 13.905 |
| 1.229600000000024 | 2.094 | 4.012 | 13.93 |
| 1.233550000000023 | 2.087 | 4.022 | 13.956 |
| 1.237500000000023 | 2.081 | 4.031 | 13.981 |
| 1.241450000000023 | 2.075 | 4.041 | 14.007 |
| 1.245400000000023 | 2.069 | 4.051 | 14.033 |
| 1.249350000000023 | 2.063 | 4.061 | 14.058 |
| 1.253300000000023 | 2.058 | 4.071 | 14.084 |
| 1.257250000000023 | 2.052 | 4.081 | 14.11 |
| 1.261200000000023 | 2.046 | 4.091 | 14.135 |
| 1.265150000000023 | 2.04 | 4.101 | 14.161 |
| 1.269100000000023 | 2.034 | 4.111 | 14.187 |
| 1.273050000000022 | 2.028 | 4.121 | 14.213 |
| 1.277000000000022 | 2.023 | 4.131 | 14.239 |
| 1.280950000000022 | 2.017 | 4.141 | 14.265 |
| 1.284900000000022 | 2.011 | 4.151 | 14.291 |
| 1.288850000000022 | 2.006 | 4.161 | 14.317 |
| 1.292800000000022 | 2 | 4.171 | 14.343 |
| 1.296750000000022 | 1.995 | 4.182 | 14.369 |
| 1.300700000000022 | 1.989 | 4.192 | 14.395 |
| 1.304650000000022 | 1.984 | 4.202 | 14.421 |
| 1.308600000000021 | 1.978 | 4.212 | 14.447 |
| 1.312550000000021 | 1.973 | 4.223 | 14.473 |
| 1.316500000000021 | 1.967 | 4.233 | 14.499 |
| 1.320450000000021 | 1.962 | 4.244 | 14.525 |
| 1.324400000000021 | 1.956 | 4.254 | 14.552 |
| 1.328350000000021 | 1.951 | 4.265 | 14.578 |
| 1.332300000000021 | 1.946 | 4.275 | 14.604 |
| 1.336250000000021 | 1.941 | 4.286 | 14.631 |
| 1.340200000000021 | 1.935 | 4.296 | 14.657 |
| 1.344150000000021 | 1.93 | 4.307 | 14.683 |
| 1.34810000000002 | 1.925 | 4.317 | 14.71 |
| 1.35205000000002 | 1.92 | 4.328 | 14.736 |
| 1.35600000000002 | 1.915 | 4.339 | 14.763 |
| 1.35995000000002 | 1.91 | 4.349 | 14.789 |
| 1.36390000000002 | 1.905 | 4.36 | 14.816 |
| 1.36785000000002 | 1.9 | 4.371 | 14.842 |
| 1.37180000000002 | 1.895 | 4.382 | 14.869 |
| 1.37575000000002 | 1.89 | 4.393 | 14.896 |
| 1.37970000000002 | 1.885 | 4.404 | 14.922 |
| 1.38365000000002 | 1.88 | 4.414 | 14.949 |
| 1.387600000000019 | 1.875 | 4.425 | 14.976 |
| 1.391550000000019 | 1.87 | 4.436 | 15.003 |
| 1.395500000000019 | 1.865 | 4.447 | 15.029 |
| 1.39945000000002 | 1.861 | 4.458 | 15.056 |
| 1.403400000000019 | 1.856 | 4.47 | 15.083 |
| 1.407350000000019 | 1.851 | 4.481 | 15.11 |
| 1.411300000000019 | 1.847 | 4.492 | 15.137 |
| 1.415250000000019 | 1.842 | 4.503 | 15.164 |
| 1.419200000000019 | 1.837 | 4.514 | 15.191 |
| 1.423150000000019 | 1.833 | 4.525 | 15.218 |
| 1.427100000000018 | 1.828 | 4.537 | 15.245 |
| 1.431050000000018 | 1.824 | 4.548 | 15.272 |
| 1.435000000000018 | 1.819 | 4.559 | 15.299 |
| 1.438950000000018 | 1.815 | 4.571 | 15.326 |
| 1.442900000000018 | 1.81 | 4.582 | 15.354 |
| 1.446850000000018 | 1.806 | 4.593 | 15.381 |
| 1.450800000000018 | 1.802 | 4.605 | 15.408 |
| 1.454750000000018 | 1.797 | 4.616 | 15.435 |
| 1.458700000000018 | 1.793 | 4.628 | 15.463 |
| 1.462650000000018 | 1.789 | 4.639 | 15.49 |
| 1.466600000000017 | 1.785 | 4.651 | 15.517 |
| 1.470550000000017 | 1.78 | 4.663 | 15.545 |
| 1.474500000000017 | 1.776 | 4.674 | 15.572 |
| 1.478450000000017 | 1.772 | 4.686 | 15.6 |
| 1.482400000000017 | 1.768 | 4.698 | 15.627 |
| 1.486350000000017 | 1.764 | 4.709 | 15.655 |
| 1.490300000000017 | 1.76 | 4.721 | 15.682 |
| 1.494250000000017 | 1.756 | 4.733 | 15.71 |
| 1.498200000000017 | 1.752 | 4.745 | 15.737 |
| 1.502150000000017 | 1.748 | 4.756 | 15.765 |
| 1.506100000000016 | 1.744 | 4.768 | 15.793 |
| 1.510050000000016 | 1.74 | 4.78 | 15.82 |
| 1.514000000000016 | 1.736 | 4.792 | 15.848 |
| 1.517950000000016 | 1.732 | 4.804 | 15.876 |
| 1.521900000000016 | 1.729 | 4.816 | 15.904 |
| 1.525850000000016 | 1.725 | 4.828 | 15.932 |
| 1.529800000000016 | 1.721 | 4.84 | 15.959 |
| 1.533750000000016 | 1.717 | 4.852 | 15.987 |
| 1.537700000000016 | 1.714 | 4.865 | 16.015 |
| 1.541650000000015 | 1.71 | 4.877 | 16.043 |
| 1.545600000000015 | 1.706 | 4.889 | 16.071 |
| 1.549550000000015 | 1.703 | 4.901 | 16.099 |
| 1.553500000000015 | 1.699 | 4.913 | 16.127 |
| 1.557450000000015 | 1.696 | 4.926 | 16.155 |
| 1.561400000000015 | 1.692 | 4.938 | 16.184 |
| 1.565350000000015 | 1.689 | 4.95 | 16.212 |
| 1.569300000000015 | 1.686 | 4.963 | 16.24 |
| 1.573250000000015 | 1.682 | 4.975 | 16.268 |
| 1.577200000000015 | 1.679 | 4.988 | 16.296 |
| 1.581150000000014 | 1.675 | 5 | 16.325 |
| 1.585100000000014 | 1.672 | 5.013 | 16.353 |
| 1.589050000000014 | 1.669 | 5.025 | 16.381 |
| 1.593000000000014 | 1.666 | 5.038 | 16.41 |
| 1.596950000000014 | 1.662 | 5.05 | 16.438 |
| 1.600900000000014 | 1.659 | 5.063 | 16.466 |
| 1.604850000000014 | 1.656 | 5.076 | 16.495 |
| 1.608800000000014 | 1.653 | 5.088 | 16.523 |
| 1.612750000000014 | 1.65 | 5.101 | 16.552 |
| 1.616700000000013 | 1.647 | 5.114 | 16.581 |
| 1.620650000000013 | 1.644 | 5.127 | 16.609 |
| 1.624600000000013 | 1.641 | 5.139 | 16.638 |
| 1.628550000000013 | 1.638 | 5.152 | 16.666 |
| 1.632500000000013 | 1.635 | 5.165 | 16.695 |
| 1.636450000000013 | 1.632 | 5.178 | 16.724 |
| 1.640400000000013 | 1.629 | 5.191 | 16.753 |
| 1.644350000000013 | 1.626 | 5.204 | 16.781 |
| 1.648300000000013 | 1.624 | 5.217 | 16.81 |
| 1.652250000000013 | 1.621 | 5.23 | 16.839 |
| 1.656200000000012 | 1.618 | 5.243 | 16.868 |
| 1.660150000000012 | 1.615 | 5.256 | 16.897 |
| 1.664100000000012 | 1.613 | 5.269 | 16.926 |
| 1.668050000000012 | 1.61 | 5.282 | 16.955 |
| 1.672000000000012 | 1.608 | 5.296 | 16.984 |
| 1.675950000000012 | 1.605 | 5.309 | 17.013 |
| 1.679900000000012 | 1.602 | 5.322 | 17.042 |
| 1.683850000000012 | 1.6 | 5.335 | 17.071 |
| 1.687800000000012 | 1.597 | 5.349 | 17.1 |
| 1.691750000000012 | 1.595 | 5.362 | 17.129 |
| 1.695700000000011 | 1.593 | 5.375 | 17.158 |
| 1.699650000000011 | 1.59 | 5.389 | 17.187 |
| 1.703600000000011 | 1.588 | 5.402 | 17.217 |
| 1.707550000000011 | 1.586 | 5.416 | 17.246 |
| 1.711500000000011 | 1.583 | 5.429 | 17.275 |
| 1.715450000000011 | 1.581 | 5.443 | 17.305 |
| 1.719400000000011 | 1.579 | 5.456 | 17.334 |
| 1.723350000000011 | 1.577 | 5.47 | 17.363 |
| 1.727300000000011 | 1.574 | 5.484 | 17.393 |
| 1.731250000000011 | 1.572 | 5.497 | 17.422 |
| 1.73520000000001 | 1.57 | 5.511 | 17.452 |
| 1.73915000000001 | 1.568 | 5.525 | 17.481 |
| 1.74310000000001 | 1.566 | 5.538 | 17.511 |
| 1.74705000000001 | 1.564 | 5.552 | 17.54 |
| 1.75100000000001 | 1.562 | 5.566 | 17.57 |
| 1.75495000000001 | 1.56 | 5.58 | 17.6 |
| 1.75890000000001 | 1.558 | 5.594 | 17.629 |
| 1.76285000000001 | 1.556 | 5.608 | 17.659 |
| 1.76680000000001 | 1.554 | 5.622 | 17.689 |
| 1.77075000000001 | 1.553 | 5.636 | 17.719 |
| 1.774700000000009 | 1.551 | 5.65 | 17.748 |
| 1.77865000000001 | 1.549 | 5.664 | 17.778 |
| 1.78260000000001 | 1.547 | 5.678 | 17.808 |
| 1.78655000000001 | 1.546 | 5.692 | 17.838 |
| 1.790500000000009 | 1.544 | 5.706 | 17.868 |
| 1.794450000000009 | 1.542 | 5.72 | 17.898 |
| 1.798400000000009 | 1.541 | 5.734 | 17.928 |
| 1.802350000000009 | 1.539 | 5.748 | 17.958 |
| 1.806300000000009 | 1.538 | 5.763 | 17.988 |
| 1.810250000000009 | 1.536 | 5.777 | 18.018 |
| 1.814200000000008 | 1.535 | 5.791 | 18.048 |
| 1.818150000000008 | 1.533 | 5.806 | 18.078 |
| 1.822100000000008 | 1.532 | 5.82 | 18.108 |
| 1.826050000000008 | 1.53 | 5.834 | 18.139 |
| 1.830000000000008 | 1.529 | 5.849 | 18.169 |
| 1.833950000000008 | 1.528 | 5.863 | 18.199 |
| 1.837900000000008 | 1.526 | 5.878 | 18.229 |
| 1.841850000000008 | 1.525 | 5.892 | 18.26 |
| 1.845800000000008 | 1.524 | 5.907 | 18.29 |
| 1.849750000000007 | 1.523 | 5.922 | 18.321 |
| 1.853700000000007 | 1.521 | 5.936 | 18.351 |
| 1.857650000000007 | 1.52 | 5.951 | 18.381 |
| 1.861600000000007 | 1.519 | 5.966 | 18.412 |
| 1.865550000000007 | 1.518 | 5.98 | 18.442 |
| 1.869500000000007 | 1.517 | 5.995 | 18.473 |
| 1.873450000000007 | 1.516 | 6.01 | 18.504 |
| 1.877400000000007 | 1.515 | 6.025 | 18.534 |
| 1.881350000000007 | 1.514 | 6.039 | 18.565 |
| 1.885300000000007 | 1.513 | 6.054 | 18.596 |
| 1.889250000000006 | 1.512 | 6.069 | 18.626 |
| 1.893200000000006 | 1.511 | 6.084 | 18.657 |
| 1.897150000000006 | 1.511 | 6.099 | 18.688 |
| 1.901100000000006 | 1.51 | 6.114 | 18.719 |
| 1.905050000000006 | 1.509 | 6.129 | 18.749 |
| 1.909000000000006 | 1.508 | 6.144 | 18.78 |
| 1.912950000000006 | 1.508 | 6.159 | 18.811 |
| 1.916900000000006 | 1.507 | 6.175 | 18.842 |
| 1.920850000000006 | 1.506 | 6.19 | 18.873 |
| 1.924800000000006 | 1.506 | 6.205 | 18.904 |
| 1.928750000000005 | 1.505 | 6.22 | 18.935 |
| 1.932700000000005 | 1.505 | 6.235 | 18.966 |
| 1.936650000000005 | 1.504 | 6.251 | 18.997 |
| 1.940600000000005 | 1.504 | 6.266 | 19.028 |
| 1.944550000000005 | 1.503 | 6.281 | 19.059 |
| 1.948500000000005 | 1.503 | 6.297 | 19.091 |
| 1.952450000000005 | 1.502 | 6.312 | 19.122 |
| 1.956400000000005 | 1.502 | 6.328 | 19.153 |
| 1.960350000000005 | 1.502 | 6.343 | 19.184 |
| 1.964300000000005 | 1.501 | 6.358 | 19.216 |
| 1.968250000000004 | 1.501 | 6.374 | 19.247 |
| 1.972200000000004 | 1.501 | 6.39 | 19.278 |
| 1.976150000000004 | 1.501 | 6.405 | 19.31 |
| 1.980100000000004 | 1.5 | 6.421 | 19.341 |
| 1.984050000000004 | 1.5 | 6.436 | 19.373 |
| 1.988000000000004 | 1.5 | 6.452 | 19.404 |
| 1.991950000000004 | 1.5 | 6.468 | 19.436 |
| 1.995900000000004 | 1.5 | 6.484 | 19.467 |
| 1.999850000000004 | 1.5 | 6.499 | 19.499 |
| 2.003800000000004 | 1.5 | 6.515 | 19.53 |
| 2.007750000000004 | 1.5 | 6.531 | 19.562 |
| 2.011700000000004 | 1.5 | 6.547 | 19.594 |
| 2.015650000000004 | 1.5 | 6.563 | 19.625 |
| 2.019600000000004 | 1.5 | 6.579 | 19.657 |
| 2.023550000000004 | 1.501 | 6.595 | 19.689 |
| 2.027500000000004 | 1.501 | 6.611 | 19.721 |
| 2.031450000000004 | 1.501 | 6.627 | 19.753 |
| 2.035400000000005 | 1.501 | 6.643 | 19.784 |
| 2.039350000000005 | 1.502 | 6.659 | 19.816 |
| 2.043300000000005 | 1.502 | 6.675 | 19.848 |
| 2.047250000000005 | 1.502 | 6.691 | 19.88 |
| 2.051200000000005 | 1.503 | 6.707 | 19.912 |
| 2.055150000000005 | 1.503 | 6.724 | 19.944 |
| 2.059100000000005 | 1.503 | 6.74 | 19.976 |
| 2.063050000000005 | 1.504 | 6.756 | 20.008 |
| 2.067000000000005 | 1.504 | 6.772 | 20.04 |
| 2.070950000000006 | 1.505 | 6.789 | 20.073 |
| 2.074900000000006 | 1.506 | 6.805 | 20.105 |
| 2.078850000000006 | 1.506 | 6.822 | 20.137 |
| 2.082800000000006 | 1.507 | 6.838 | 20.169 |
| 2.086750000000006 | 1.508 | 6.855 | 20.202 |
| 2.090700000000006 | 1.508 | 6.871 | 20.234 |
| 2.094650000000006 | 1.509 | 6.888 | 20.266 |
| 2.098600000000006 | 1.51 | 6.904 | 20.299 |
| 2.102550000000007 | 1.511 | 6.921 | 20.331 |
| 2.106500000000007 | 1.511 | 6.937 | 20.363 |
| 2.110450000000007 | 1.512 | 6.954 | 20.396 |
| 2.114400000000007 | 1.513 | 6.971 | 20.428 |
| 2.118350000000007 | 1.514 | 6.987 | 20.461 |
| 2.122300000000007 | 1.515 | 7.004 | 20.493 |
| 2.126250000000007 | 1.516 | 7.021 | 20.526 |
| 2.130200000000007 | 1.517 | 7.038 | 20.559 |
| 2.134150000000008 | 1.518 | 7.055 | 20.591 |
| 2.138100000000008 | 1.519 | 7.071 | 20.624 |
| 2.142050000000008 | 1.52 | 7.088 | 20.657 |
| 2.146000000000008 | 1.521 | 7.105 | 20.689 |
| 2.149950000000008 | 1.522 | 7.122 | 20.722 |
| 2.153900000000008 | 1.524 | 7.139 | 20.755 |
| 2.157850000000008 | 1.525 | 7.156 | 20.788 |
| 2.161800000000008 | 1.526 | 7.173 | 20.821 |
| 2.165750000000008 | 1.527 | 7.19 | 20.853 |
| 2.169700000000009 | 1.529 | 7.208 | 20.886 |
| 2.173650000000009 | 1.53 | 7.225 | 20.919 |
| 2.177600000000009 | 1.532 | 7.242 | 20.952 |
| 2.181550000000009 | 1.533 | 7.259 | 20.985 |
| 2.18550000000001 | 1.534 | 7.276 | 21.018 |
| 2.189450000000009 | 1.536 | 7.294 | 21.051 |
| 2.193400000000009 | 1.537 | 7.311 | 21.085 |
| 2.197350000000009 | 1.539 | 7.328 | 21.118 |
| 2.20130000000001 | 1.541 | 7.346 | 21.151 |
| 2.20525000000001 | 1.542 | 7.363 | 21.184 |
| 2.20920000000001 | 1.544 | 7.381 | 21.217 |
| 2.21315000000001 | 1.545 | 7.398 | 21.251 |
| 2.21710000000001 | 1.547 | 7.416 | 21.284 |
| 2.22105000000001 | 1.549 | 7.433 | 21.317 |
| 2.22500000000001 | 1.551 | 7.451 | 21.351 |
| 2.22895000000001 | 1.552 | 7.468 | 21.384 |
| 2.232900000000011 | 1.554 | 7.486 | 21.417 |
| 2.236850000000011 | 1.556 | 7.503 | 21.451 |
| 2.240800000000011 | 1.558 | 7.521 | 21.484 |
| 2.244750000000011 | 1.56 | 7.539 | 21.518 |
| 2.248700000000011 | 1.562 | 7.557 | 21.551 |
| 2.252650000000011 | 1.564 | 7.574 | 21.585 |
| 2.256600000000011 | 1.566 | 7.592 | 21.619 |
| 2.260550000000011 | 1.568 | 7.61 | 21.652 |
| 2.264500000000011 | 1.57 | 7.628 | 21.686 |
| 2.268450000000012 | 1.572 | 7.646 | 21.72 |
| 2.272400000000012 | 1.574 | 7.664 | 21.753 |
| 2.276350000000012 | 1.576 | 7.682 | 21.787 |
| 2.280300000000012 | 1.579 | 7.7 | 21.821 |
| 2.284250000000012 | 1.581 | 7.718 | 21.855 |
| 2.288200000000012 | 1.583 | 7.736 | 21.889 |
| 2.292150000000012 | 1.585 | 7.754 | 21.923 |
| 2.296100000000012 | 1.588 | 7.772 | 21.956 |
| 2.300050000000013 | 1.59 | 7.79 | 21.99 |
| 2.304000000000013 | 1.592 | 7.808 | 22.024 |
| 2.307950000000013 | 1.595 | 7.827 | 22.058 |
| 2.311900000000013 | 1.597 | 7.845 | 22.092 |
| 2.315850000000013 | 1.6 | 7.863 | 22.127 |
| 2.319800000000013 | 1.602 | 7.881 | 22.161 |
| 2.323750000000013 | 1.605 | 7.9 | 22.195 |
| 2.327700000000013 | 1.607 | 7.918 | 22.229 |
| 2.331650000000013 | 1.61 | 7.937 | 22.263 |
| 2.335600000000014 | 1.613 | 7.955 | 22.297 |
| 2.339550000000014 | 1.615 | 7.973 | 22.332 |
| 2.343500000000014 | 1.618 | 7.992 | 22.366 |
| 2.347450000000014 | 1.621 | 8.011 | 22.4 |
| 2.351400000000014 | 1.623 | 8.029 | 22.435 |
| 2.355350000000014 | 1.626 | 8.048 | 22.469 |
| 2.359300000000014 | 1.629 | 8.066 | 22.503 |
| 2.363250000000014 | 1.632 | 8.085 | 22.538 |
| 2.367200000000015 | 1.635 | 8.104 | 22.572 |
| 2.371150000000015 | 1.638 | 8.122 | 22.607 |
| 2.375100000000015 | 1.641 | 8.141 | 22.642 |
| 2.379050000000015 | 1.644 | 8.16 | 22.676 |
| 2.383000000000015 | 1.647 | 8.179 | 22.711 |
| 2.386950000000015 | 1.65 | 8.198 | 22.745 |
| 2.390900000000015 | 1.653 | 8.216 | 22.78 |
| 2.394850000000015 | 1.656 | 8.235 | 22.815 |
| 2.398800000000016 | 1.659 | 8.254 | 22.849 |
| 2.402750000000016 | 1.662 | 8.273 | 22.884 |
| 2.406700000000016 | 1.665 | 8.292 | 22.919 |
| 2.410650000000016 | 1.669 | 8.311 | 22.954 |
| 2.414600000000016 | 1.672 | 8.33 | 22.989 |
| 2.418550000000016 | 1.675 | 8.349 | 23.024 |
| 2.422500000000016 | 1.679 | 8.369 | 23.059 |
| 2.426450000000016 | 1.682 | 8.388 | 23.093 |
| 2.430400000000017 | 1.685 | 8.407 | 23.128 |
| 2.434350000000017 | 1.689 | 8.426 | 23.163 |
| 2.438300000000017 | 1.692 | 8.445 | 23.199 |
| 2.442250000000017 | 1.696 | 8.465 | 23.234 |
| 2.446200000000017 | 1.699 | 8.484 | 23.269 |
| 2.450150000000017 | 1.703 | 8.503 | 23.304 |
| 2.454100000000017 | 1.706 | 8.523 | 23.339 |
| 2.458050000000017 | 1.71 | 8.542 | 23.374 |
| 2.462000000000017 | 1.713 | 8.561 | 23.409 |
| 2.465950000000018 | 1.717 | 8.581 | 23.445 |
| 2.469900000000018 | 1.721 | 8.6 | 23.48 |
| 2.473850000000018 | 1.725 | 8.62 | 23.515 |
| 2.477800000000018 | 1.728 | 8.639 | 23.551 |
| 2.481750000000018 | 1.732 | 8.659 | 23.586 |
| 2.485700000000018 | 1.736 | 8.679 | 23.622 |
| 2.489650000000018 | 1.74 | 8.698 | 23.657 |
| 2.493600000000018 | 1.744 | 8.718 | 23.692 |
| 2.497550000000019 | 1.748 | 8.738 | 23.728 |
| 2.501500000000019 | 1.752 | 8.758 | 23.764 |
| 2.505450000000019 | 1.755 | 8.777 | 23.799 |
| 2.509400000000019 | 1.759 | 8.797 | 23.835 |
| 2.51335000000002 | 1.764 | 8.817 | 23.87 |
| 2.51730000000002 | 1.768 | 8.837 | 23.906 |
| 2.521250000000019 | 1.772 | 8.857 | 23.942 |
| 2.525200000000019 | 1.776 | 8.877 | 23.977 |
| 2.52915000000002 | 1.78 | 8.897 | 24.013 |
| 2.53310000000002 | 1.784 | 8.917 | 24.049 |
| 2.53705000000002 | 1.788 | 8.937 | 24.085 |
| 2.54100000000002 | 1.793 | 8.957 | 24.121 |
| 2.54495000000002 | 1.797 | 8.977 | 24.157 |
| 2.54890000000002 | 1.801 | 8.997 | 24.192 |
| 2.55285000000002 | 1.806 | 9.017 | 24.228 |
| 2.55680000000002 | 1.81 | 9.037 | 24.264 |
| 2.56075000000002 | 1.814 | 9.057 | 24.3 |
| 2.564700000000021 | 1.819 | 9.078 | 24.336 |
| 2.568650000000021 | 1.823 | 9.098 | 24.373 |
| 2.572600000000021 | 1.828 | 9.118 | 24.409 |
| 2.576550000000021 | 1.832 | 9.139 | 24.445 |
| 2.580500000000021 | 1.837 | 9.159 | 24.481 |
| 2.584450000000021 | 1.842 | 9.179 | 24.517 |
| 2.588400000000021 | 1.846 | 9.2 | 24.553 |
| 2.592350000000021 | 1.851 | 9.22 | 24.59 |
| 2.596300000000022 | 1.856 | 9.241 | 24.626 |
| 2.600250000000022 | 1.86 | 9.261 | 24.662 |
| 2.604200000000022 | 1.865 | 9.282 | 24.699 |
| 2.608150000000022 | 1.87 | 9.302 | 24.735 |
| 2.612100000000022 | 1.875 | 9.323 | 24.771 |
| 2.616050000000022 | 1.88 | 9.344 | 24.808 |
| 2.620000000000022 | 1.884 | 9.364 | 24.844 |
| 2.623950000000022 | 1.889 | 9.385 | 24.881 |
| 2.627900000000022 | 1.894 | 9.406 | 24.917 |
| 2.631850000000023 | 1.899 | 9.427 | 24.954 |
| 2.635800000000023 | 1.904 | 9.447 | 24.991 |
| 2.639750000000023 | 1.909 | 9.468 | 25.027 |
| 2.643700000000023 | 1.914 | 9.489 | 25.064 |
| 2.647650000000023 | 1.919 | 9.51 | 25.101 |
| 2.651600000000023 | 1.925 | 9.531 | 25.137 |
| 2.655550000000023 | 1.93 | 9.552 | 25.174 |
| 2.659500000000023 | 1.935 | 9.573 | 25.211 |
| 2.663450000000024 | 1.94 | 9.594 | 25.248 |
| 2.667400000000024 | 1.945 | 9.615 | 25.285 |
| 2.671350000000024 | 1.951 | 9.636 | 25.322 |
| 2.675300000000024 | 1.956 | 9.657 | 25.358 |
| 2.679250000000024 | 1.961 | 9.678 | 25.395 |
| 2.683200000000024 | 1.967 | 9.7 | 25.432 |
| 2.687150000000024 | 1.972 | 9.721 | 25.469 |
| 2.691100000000024 | 1.978 | 9.742 | 25.506 |
| 2.695050000000024 | 1.983 | 9.763 | 25.543 |
| 2.699000000000025 | 1.989 | 9.785 | 25.581 |
| 2.702950000000025 | 1.994 | 9.806 | 25.618 |
| 2.706900000000025 | 2 | 9.827 | 25.655 |
| 2.710850000000025 | 2.005 | 9.849 | 25.692 |
| 2.714800000000025 | 2.011 | 9.87 | 25.729 |
| 2.718750000000025 | 2.017 | 9.892 | 25.767 |
| 2.722700000000025 | 2.022 | 9.913 | 25.804 |
| 2.726650000000025 | 2.028 | 9.935 | 25.841 |
| 2.730600000000026 | 2.034 | 9.956 | 25.879 |
| 2.734550000000026 | 2.04 | 9.978 | 25.916 |
| 2.738500000000026 | 2.045 | 9.999 | 25.953 |
| 2.742450000000026 | 2.051 | 10.021 | 25.991 |
| 2.746400000000026 | 2.057 | 10.043 | 26.028 |
| 2.750350000000026 | 2.063 | 10.064 | 26.066 |
| 2.754300000000026 | 2.069 | 10.086 | 26.103 |
| 2.758250000000026 | 2.075 | 10.108 | 26.141 |
| 2.762200000000027 | 2.081 | 10.13 | 26.179 |
| 2.766150000000027 | 2.087 | 10.152 | 26.216 |
| 2.770100000000027 | 2.093 | 10.173 | 26.254 |
| 2.774050000000027 | 2.099 | 10.195 | 26.292 |
| 2.778000000000027 | 2.105 | 10.217 | 26.329 |
| 2.781950000000027 | 2.111 | 10.239 | 26.367 |
| 2.785900000000027 | 2.118 | 10.261 | 26.405 |
| 2.789850000000027 | 2.124 | 10.283 | 26.443 |
| 2.793800000000028 | 2.13 | 10.305 | 26.481 |
| 2.797750000000028 | 2.136 | 10.327 | 26.518 |
| 2.801700000000028 | 2.143 | 10.35 | 26.556 |
| 2.805650000000028 | 2.149 | 10.372 | 26.594 |
| 2.809600000000028 | 2.155 | 10.394 | 26.632 |
| 2.813550000000028 | 2.162 | 10.416 | 26.67 |
| 2.817500000000028 | 2.168 | 10.438 | 26.708 |
| 2.821450000000028 | 2.175 | 10.461 | 26.746 |
| 2.825400000000029 | 2.181 | 10.483 | 26.784 |
| 2.829350000000029 | 2.188 | 10.505 | 26.823 |
| 2.833300000000029 | 2.194 | 10.528 | 26.861 |
| 2.837250000000029 | 2.201 | 10.55 | 26.899 |
| 2.841200000000029 | 2.208 | 10.572 | 26.937 |
| 2.845150000000029 | 2.214 | 10.595 | 26.975 |
| 2.849100000000029 | 2.221 | 10.617 | 27.014 |
| 2.853050000000029 | 2.228 | 10.64 | 27.052 |
| 2.857000000000029 | 2.234 | 10.662 | 27.09 |
| 2.86095000000003 | 2.241 | 10.685 | 27.129 |
| 2.86490000000003 | 2.248 | 10.708 | 27.167 |
| 2.86885000000003 | 2.255 | 10.73 | 27.206 |
| 2.87280000000003 | 2.262 | 10.753 | 27.244 |
| 2.87675000000003 | 2.269 | 10.776 | 27.283 |
| 2.88070000000003 | 2.276 | 10.798 | 27.321 |
| 2.88465000000003 | 2.283 | 10.821 | 27.36 |
| 2.88860000000003 | 2.29 | 10.844 | 27.398 |
| 2.892550000000031 | 2.297 | 10.867 | 27.437 |
| 2.896500000000031 | 2.304 | 10.89 | 27.476 |
| 2.900450000000031 | 2.311 | 10.913 | 27.514 |
| 2.904400000000031 | 2.318 | 10.936 | 27.553 |
| 2.908350000000031 | 2.325 | 10.958 | 27.592 |
| 2.912300000000031 | 2.332 | 10.981 | 27.631 |
| 2.916250000000031 | 2.34 | 11.005 | 27.67 |
| 2.920200000000031 | 2.347 | 11.028 | 27.708 |
| 2.924150000000032 | 2.354 | 11.051 | 27.747 |
| 2.928100000000032 | 2.361 | 11.074 | 27.786 |
| 2.932050000000032 | 2.369 | 11.097 | 27.825 |
| 2.936000000000032 | 2.376 | 11.12 | 27.864 |
| 2.939950000000032 | 2.384 | 11.143 | 27.903 |
| 2.943900000000032 | 2.391 | 11.167 | 27.942 |
| 2.947850000000032 | 2.398 | 11.19 | 27.981 |
| 2.951800000000032 | 2.406 | 11.213 | 28.02 |
| 2.955750000000032 | 2.413 | 11.236 | 28.059 |
| 2.959700000000033 | 2.421 | 11.26 | 28.099 |
| 2.963650000000033 | 2.429 | 11.283 | 28.138 |
| 2.967600000000033 | 2.436 | 11.307 | 28.177 |
| 2.971550000000033 | 2.444 | 11.33 | 28.216 |
| 2.975500000000033 | 2.452 | 11.354 | 28.256 |
| 2.979450000000033 | 2.459 | 11.377 | 28.295 |
| 2.983400000000033 | 2.467 | 11.401 | 28.334 |
| 2.987350000000033 | 2.475 | 11.424 | 28.374 |
| 2.991300000000034 | 2.483 | 11.448 | 28.413 |
| 2.995250000000034 | 2.491 | 11.472 | 28.453 |
| 2.999200000000034 | 2.498 | 11.495 | 28.492 |
| 3.003150000000034 | 2.506 | 11.519 | 28.532 |
| 3.007100000000034 | 2.514 | 11.543 | 28.571 |
| 3.011050000000034 | 2.522 | 11.566 | 28.611 |
| 3.015000000000034 | 2.53 | 11.59 | 28.65 |
| 3.018950000000034 | 2.538 | 11.614 | 28.69 |
| 3.022900000000035 | 2.546 | 11.638 | 28.73 |
| 3.026850000000035 | 2.554 | 11.662 | 28.769 |
| 3.030800000000035 | 2.563 | 11.686 | 28.809 |
| 3.034750000000035 | 2.571 | 11.71 | 28.849 |
| 3.038700000000035 | 2.579 | 11.734 | 28.888 |
| 3.042650000000035 | 2.587 | 11.758 | 28.928 |
| 3.046600000000035 | 2.595 | 11.782 | 28.968 |
| 3.050550000000035 | 2.604 | 11.806 | 29.008 |
| 3.054500000000036 | 2.612 | 11.83 | 29.048 |
| 3.058450000000036 | 2.62 | 11.854 | 29.088 |
| 3.062400000000036 | 2.629 | 11.878 | 29.128 |
| 3.066350000000036 | 2.637 | 11.903 | 29.168 |
| 3.070300000000036 | 2.646 | 11.927 | 29.208 |
| 3.074250000000036 | 2.654 | 11.951 | 29.248 |
| 3.078200000000036 | 2.663 | 11.975 | 29.288 |
| 3.082150000000036 | 2.671 | 12 | 29.328 |
| 3.086100000000036 | 2.68 | 12.024 | 29.368 |
| 3.090050000000037 | 2.688 | 12.048 | 29.409 |
| 3.094000000000037 | 2.697 | 12.073 | 29.449 |
| 3.097950000000037 | 2.705 | 12.097 | 29.489 |
| 3.101900000000037 | 2.714 | 12.122 | 29.529 |
| 3.105850000000037 | 2.723 | 12.146 | 29.57 |
| 3.109800000000037 | 2.732 | 12.171 | 29.61 |
| 3.113750000000037 | 2.74 | 12.195 | 29.65 |
| 3.117700000000037 | 2.749 | 12.22 | 29.691 |
| 3.121650000000038 | 2.758 | 12.245 | 29.731 |
| 3.125600000000038 | 2.767 | 12.269 | 29.772 |
| 3.129550000000038 | 2.776 | 12.294 | 29.812 |
| 3.133500000000038 | 2.785 | 12.319 | 29.853 |
| 3.137450000000038 | 2.794 | 12.344 | 29.893 |
| 3.141400000000038 | 2.803 | 12.368 | 29.934 |
| 3.145350000000038 | 2.812 | 12.393 | 29.975 |
| 3.149300000000038 | 2.821 | 12.418 | 30.015 |
| 3.153250000000039 | 2.83 | 12.443 | 30.056 |
| 3.157200000000039 | 2.839 | 12.468 | 30.097 |
| 3.161150000000039 | 2.848 | 12.493 | 30.137 |
| 3.165100000000039 | 2.857 | 12.518 | 30.178 |
| 3.169050000000039 | 2.867 | 12.543 | 30.219 |
| 3.17300000000004 | 2.876 | 12.568 | 30.26 |
| 3.176950000000039 | 2.885 | 12.593 | 30.301 |
| 3.18090000000004 | 2.895 | 12.618 | 30.342 |
| 3.184850000000039 | 2.904 | 12.643 | 30.383 |
| 3.18880000000004 | 2.913 | 12.668 | 30.424 |
| 3.19275000000004 | 2.923 | 12.694 | 30.465 |
| 3.19670000000004 | 2.932 | 12.719 | 30.506 |
| 3.20065000000004 | 2.942 | 12.744 | 30.547 |
| 3.20460000000004 | 2.951 | 12.769 | 30.588 |
| 3.20855000000004 | 2.961 | 12.795 | 30.629 |
| 3.21250000000004 | 2.97 | 12.82 | 30.67 |
| 3.21645000000004 | 2.98 | 12.846 | 30.711 |
| 3.220400000000041 | 2.989 | 12.871 | 30.753 |
| 3.224350000000041 | 2.999 | 12.896 | 30.794 |
| 3.228300000000041 | 3.009 | 12.922 | 30.835 |
| 3.232250000000041 | 3.018 | 12.947 | 30.876 |
| 3.236200000000041 | 3.028 | 12.973 | 30.918 |
| 3.240150000000041 | 3.038 | 12.999 | 30.959 |
| 3.244100000000041 | 3.048 | 13.024 | 31.001 |
| 3.248050000000041 | 3.058 | 13.05 | 31.042 |
| 3.252000000000042 | 3.068 | 13.076 | 31.084 |
| 3.255950000000042 | 3.077 | 13.101 | 31.125 |
| 3.259900000000042 | 3.087 | 13.127 | 31.167 |
| 3.263850000000042 | 3.097 | 13.153 | 31.208 |
| 3.267800000000042 | 3.107 | 13.179 | 31.25 |
| 3.271750000000042 | 3.117 | 13.204 | 31.291 |
| 3.275700000000042 | 3.127 | 13.23 | 31.333 |
| 3.279650000000042 | 3.138 | 13.256 | 31.375 |
| 3.283600000000042 | 3.148 | 13.282 | 31.416 |
| 3.287550000000042 | 3.158 | 13.308 | 31.458 |
| 3.291500000000043 | 3.168 | 13.334 | 31.5 |
| 3.295450000000043 | 3.178 | 13.36 | 31.542 |
| 3.299400000000043 | 3.188 | 13.386 | 31.584 |
| 3.303350000000043 | 3.199 | 13.412 | 31.626 |
| 3.307300000000043 | 3.209 | 13.438 | 31.667 |
| 3.311250000000043 | 3.219 | 13.464 | 31.709 |
| 3.315200000000043 | 3.23 | 13.491 | 31.751 |
| 3.319150000000044 | 3.24 | 13.517 | 31.793 |
| 3.323100000000044 | 3.251 | 13.543 | 31.835 |
| 3.327050000000044 | 3.261 | 13.569 | 31.877 |
| 3.331000000000044 | 3.272 | 13.596 | 31.92 |
| 3.334950000000044 | 3.282 | 13.622 | 31.962 |
| 3.338900000000044 | 3.293 | 13.648 | 32.004 |
| 3.342850000000044 | 3.303 | 13.675 | 32.046 |
| 3.346800000000044 | 3.314 | 13.701 | 32.088 |
| 3.350750000000044 | 3.325 | 13.728 | 32.131 |
| 3.354700000000045 | 3.335 | 13.754 | 32.173 |
| 3.358650000000045 | 3.346 | 13.781 | 32.215 |
| 3.362600000000045 | 3.357 | 13.807 | 32.257 |
| 3.366550000000045 | 3.367 | 13.834 | 32.3 |
| 3.370500000000045 | 3.378 | 13.86 | 32.342 |
| 3.374450000000045 | 3.389 | 13.887 | 32.385 |
| 3.378400000000045 | 3.4 | 13.914 | 32.427 |
| 3.382350000000045 | 3.411 | 13.94 | 32.47 |
| 3.386300000000046 | 3.422 | 13.967 | 32.512 |
| 3.390250000000046 | 3.433 | 13.994 | 32.555 |
| 3.394200000000046 | 3.444 | 14.021 | 32.597 |
| 3.398150000000046 | 3.455 | 14.047 | 32.64 |
| 3.402100000000046 | 3.466 | 14.074 | 32.683 |
| 3.406050000000046 | 3.477 | 14.101 | 32.725 |
| 3.410000000000046 | 3.488 | 14.128 | 32.768 |
| 3.413950000000046 | 3.499 | 14.155 | 32.811 |
| 3.417900000000047 | 3.51 | 14.182 | 32.854 |
| 3.421850000000047 | 3.522 | 14.209 | 32.896 |
| 3.425800000000047 | 3.533 | 14.236 | 32.939 |
| 3.429750000000047 | 3.544 | 14.263 | 32.982 |
| 3.433700000000047 | 3.555 | 14.29 | 33.025 |
| 3.437650000000047 | 3.567 | 14.317 | 33.068 |
| 3.441600000000047 | 3.578 | 14.345 | 33.111 |
| 3.445550000000047 | 3.59 | 14.372 | 33.154 |
| 3.449500000000047 | 3.601 | 14.399 | 33.197 |
| 3.453450000000048 | 3.613 | 14.426 | 33.24 |
| 3.457400000000048 | 3.624 | 14.454 | 33.283 |
| 3.461350000000048 | 3.636 | 14.481 | 33.326 |
| 3.465300000000048 | 3.647 | 14.508 | 33.37 |
| 3.469250000000048 | 3.659 | 14.536 | 33.413 |
| 3.473200000000048 | 3.67 | 14.563 | 33.456 |
| 3.477150000000048 | 3.682 | 14.591 | 33.499 |
| 3.481100000000048 | 3.694 | 14.618 | 33.542 |
| 3.485050000000049 | 3.705 | 14.646 | 33.586 |
| 3.489000000000049 | 3.717 | 14.673 | 33.629 |
| 3.492950000000049 | 3.729 | 14.701 | 33.672 |
| 3.496900000000049 | 3.741 | 14.728 | 33.716 |
| 3.500850000000049 | 3.753 | 14.756 | 33.759 |
| 3.504800000000049 | 3.764 | 14.784 | 33.803 |
| 3.508750000000049 | 3.776 | 14.811 | 33.846 |
| 3.512700000000049 | 3.788 | 14.839 | 33.89 |
| 3.51665000000005 | 3.8 | 14.867 | 33.933 |
| 3.52060000000005 | 3.812 | 14.895 | 33.977 |
| 3.52455000000005 | 3.824 | 14.922 | 34.021 |
| 3.52850000000005 | 3.836 | 14.95 | 34.064 |
| 3.53245000000005 | 3.848 | 14.978 | 34.108 |
| 3.53640000000005 | 3.861 | 15.006 | 34.152 |
| 3.54035000000005 | 3.873 | 15.034 | 34.195 |
| 3.54430000000005 | 3.885 | 15.062 | 34.239 |
| 3.548250000000051 | 3.897 | 15.09 | 34.283 |
| 3.552200000000051 | 3.909 | 15.118 | 34.327 |
| 3.556150000000051 | 3.922 | 15.146 | 34.371 |
| 3.560100000000051 | 3.934 | 15.174 | 34.415 |
| 3.564050000000051 | 3.946 | 15.202 | 34.459 |
| 3.568000000000051 | 3.959 | 15.231 | 34.503 |
| 3.571950000000051 | 3.971 | 15.259 | 34.547 |
| 3.575900000000051 | 3.983 | 15.287 | 34.591 |
| 3.579850000000051 | 3.996 | 15.315 | 34.635 |
| 3.583800000000052 | 4.008 | 15.344 | 34.679 |
| 3.587750000000052 | 4.021 | 15.372 | 34.723 |
| 3.591700000000052 | 4.034 | 15.4 | 34.767 |
| 3.595650000000052 | 4.046 | 15.429 | 34.811 |
| 3.599600000000052 | 4.059 | 15.457 | 34.856 |
| 3.603550000000052 | 4.071 | 15.486 | 34.9 |
| 3.607500000000052 | 4.084 | 15.514 | 34.944 |
| 3.611450000000052 | 4.097 | 15.543 | 34.988 |
| 3.615400000000052 | 4.11 | 15.571 | 35.033 |
| 3.619350000000053 | 4.122 | 15.6 | 35.077 |
| 3.623300000000052 | 4.135 | 15.628 | 35.122 |
| 3.627250000000053 | 4.148 | 15.657 | 35.166 |
| 3.631200000000053 | 4.161 | 15.686 | 35.21 |
| 3.635150000000053 | 4.174 | 15.714 | 35.255 |
| 3.639100000000053 | 4.187 | 15.743 | 35.299 |
| 3.643050000000053 | 4.2 | 15.772 | 35.344 |
| 3.647000000000053 | 4.213 | 15.801 | 35.389 |
| 3.650950000000054 | 4.226 | 15.829 | 35.433 |
| 3.654900000000054 | 4.239 | 15.858 | 35.478 |
| 3.658850000000054 | 4.252 | 15.887 | 35.523 |
| 3.662800000000054 | 4.265 | 15.916 | 35.567 |
| 3.666750000000054 | 4.278 | 15.945 | 35.612 |
| 3.670700000000054 | 4.291 | 15.974 | 35.657 |
| 3.674650000000054 | 4.304 | 16.003 | 35.702 |
| 3.678600000000054 | 4.318 | 16.032 | 35.746 |
| 3.682550000000055 | 4.331 | 16.061 | 35.791 |
| 3.686500000000055 | 4.344 | 16.09 | 35.836 |
| 3.690450000000055 | 4.358 | 16.119 | 35.881 |
| 3.694400000000055 | 4.371 | 16.149 | 35.926 |
| 3.698350000000055 | 4.384 | 16.178 | 35.971 |
| 3.702300000000055 | 4.398 | 16.207 | 36.016 |
| 3.706250000000055 | 4.411 | 16.236 | 36.061 |
| 3.710200000000055 | 4.425 | 16.266 | 36.106 |
| 3.714150000000056 | 4.438 | 16.295 | 36.152 |
| 3.718100000000056 | 4.452 | 16.324 | 36.197 |
| 3.722050000000056 | 4.465 | 16.354 | 36.242 |
| 3.726000000000056 | 4.479 | 16.383 | 36.287 |
| 3.729950000000056 | 4.493 | 16.413 | 36.332 |
| 3.733900000000056 | 4.506 | 16.442 | 36.378 |
| 3.737850000000056 | 4.52 | 16.472 | 36.423 |
| 3.741800000000056 | 4.534 | 16.501 | 36.468 |
| 3.745750000000056 | 4.548 | 16.531 | 36.514 |
| 3.749700000000056 | 4.561 | 16.56 | 36.559 |
| 3.753650000000057 | 4.575 | 16.59 | 36.604 |
| 3.757600000000057 | 4.589 | 16.62 | 36.65 |
| 3.761550000000057 | 4.603 | 16.649 | 36.695 |
| 3.765500000000057 | 4.617 | 16.679 | 36.741 |
| 3.769450000000057 | 4.631 | 16.709 | 36.787 |
| 3.773400000000057 | 4.645 | 16.739 | 36.832 |
| 3.777350000000057 | 4.659 | 16.768 | 36.878 |
| 3.781300000000057 | 4.673 | 16.798 | 36.923 |
| 3.785250000000058 | 4.687 | 16.828 | 36.969 |
| 3.789200000000058 | 4.701 | 16.858 | 37.015 |
| 3.793150000000058 | 4.715 | 16.888 | 37.061 |
| 3.797100000000058 | 4.73 | 16.918 | 37.106 |
| 3.801050000000058 | 4.744 | 16.948 | 37.152 |
| 3.805000000000058 | 4.758 | 16.978 | 37.198 |
| 3.808950000000058 | 4.772 | 17.008 | 37.244 |
| 3.812900000000059 | 4.787 | 17.038 | 37.29 |
| 3.816850000000059 | 4.801 | 17.068 | 37.336 |
| 3.820800000000059 | 4.815 | 17.099 | 37.382 |
| 3.824750000000059 | 4.83 | 17.129 | 37.428 |
| 3.82870000000006 | 4.844 | 17.159 | 37.474 |
| 3.832650000000059 | 4.859 | 17.189 | 37.52 |
| 3.836600000000059 | 4.873 | 17.219 | 37.566 |
| 3.840550000000059 | 4.888 | 17.25 | 37.612 |
| 3.844500000000059 | 4.902 | 17.28 | 37.658 |
| 3.84845000000006 | 4.917 | 17.311 | 37.704 |
| 3.85240000000006 | 4.931 | 17.341 | 37.751 |
| 3.85635000000006 | 4.946 | 17.371 | 37.797 |
| 3.86030000000006 | 4.961 | 17.402 | 37.843 |
| 3.86425000000006 | 4.975 | 17.432 | 37.889 |
| 3.86820000000006 | 4.99 | 17.463 | 37.936 |
| 3.87215000000006 | 5.005 | 17.494 | 37.982 |
| 3.87610000000006 | 5.02 | 17.524 | 38.029 |
| 3.880050000000061 | 5.035 | 17.555 | 38.075 |
| 3.884000000000061 | 5.049 | 17.585 | 38.121 |
| 3.887950000000061 | 5.064 | 17.616 | 38.168 |
| 3.891900000000061 | 5.079 | 17.647 | 38.214 |
| 3.895850000000061 | 5.094 | 17.678 | 38.261 |
| 3.899800000000061 | 5.109 | 17.708 | 38.308 |
| 3.903750000000061 | 5.124 | 17.739 | 38.354 |
| 3.907700000000061 | 5.139 | 17.77 | 38.401 |
| 3.911650000000062 | 5.154 | 17.801 | 38.448 |
| 3.915600000000062 | 5.17 | 17.832 | 38.494 |
| 3.919550000000062 | 5.185 | 17.863 | 38.541 |
| 3.923500000000062 | 5.2 | 17.894 | 38.588 |
| 3.927450000000062 | 5.215 | 17.925 | 38.635 |
| 3.931400000000062 | 5.23 | 17.956 | 38.682 |
| 3.935350000000062 | 5.246 | 17.987 | 38.728 |
| 3.939300000000062 | 5.261 | 18.018 | 38.775 |
| 3.943250000000063 | 5.276 | 18.049 | 38.822 |
| 3.947200000000063 | 5.292 | 18.08 | 38.869 |
| 3.951150000000063 | 5.307 | 18.112 | 38.916 |
| 3.955100000000063 | 5.322 | 18.143 | 38.963 |
| 3.959050000000063 | 5.338 | 18.174 | 39.01 |
| 3.963000000000063 | 5.353 | 18.205 | 39.057 |
| 3.966950000000063 | 5.369 | 18.237 | 39.104 |
| 3.970900000000063 | 5.384 | 18.268 | 39.152 |
| 3.974850000000063 | 5.4 | 18.299 | 39.199 |
| 3.978800000000064 | 5.416 | 18.331 | 39.246 |
| 3.982750000000064 | 5.431 | 18.362 | 39.293 |
| 3.986700000000064 | 5.447 | 18.394 | 39.341 |
| 3.990650000000064 | 5.463 | 18.425 | 39.388 |
| 3.994600000000064 | 5.478 | 18.457 | 39.435 |
| 3.998550000000064 | 5.494 | 18.488 | 39.483 |
| 4.002500000000064 | 5.51 | 18.52 | 39.53 |
| 4.006450000000064 | 5.526 | 18.552 | 39.577 |
| 4.010400000000064 | 5.542 | 18.583 | 39.625 |
| 4.014350000000063 | 5.558 | 18.615 | 39.672 |
| 4.018300000000063 | 5.574 | 18.647 | 39.72 |
| 4.022250000000063 | 5.589 | 18.678 | 39.767 |
| 4.026200000000062 | 5.605 | 18.71 | 39.815 |
| 4.030150000000062 | 5.622 | 18.742 | 39.863 |
| 4.034100000000062 | 5.638 | 18.774 | 39.91 |
| 4.038050000000061 | 5.654 | 18.806 | 39.958 |
| 4.042000000000061 | 5.67 | 18.838 | 40.006 |
| 4.045950000000061 | 5.686 | 18.87 | 40.054 |
| 4.04990000000006 | 5.702 | 18.902 | 40.101 |
| 4.05385000000006 | 5.718 | 18.934 | 40.149 |
| 4.05780000000006 | 5.735 | 18.966 | 40.197 |
| 4.061750000000059 | 5.751 | 18.998 | 40.245 |
| 4.065700000000059 | 5.767 | 19.03 | 40.293 |
| 4.069650000000059 | 5.783 | 19.062 | 40.341 |
| 4.073600000000058 | 5.8 | 19.094 | 40.389 |
| 4.077550000000058 | 5.816 | 19.126 | 40.437 |
| 4.081500000000058 | 5.833 | 19.159 | 40.485 |
| 4.085450000000058 | 5.849 | 19.191 | 40.533 |
| 4.089400000000057 | 5.866 | 19.223 | 40.581 |
| 4.093350000000057 | 5.882 | 19.256 | 40.629 |
| 4.097300000000057 | 5.899 | 19.288 | 40.677 |
| 4.101250000000056 | 5.915 | 19.32 | 40.725 |
| 4.105200000000056 | 5.932 | 19.353 | 40.773 |
| 4.109150000000056 | 5.949 | 19.385 | 40.822 |
| 4.113100000000055 | 5.965 | 19.418 | 40.87 |
| 4.117050000000055 | 5.982 | 19.45 | 40.918 |
| 4.121000000000055 | 5.999 | 19.483 | 40.967 |
| 4.124950000000054 | 6.015 | 19.515 | 41.015 |
| 4.128900000000054 | 6.032 | 19.548 | 41.063 |
| 4.132850000000054 | 6.049 | 19.58 | 41.112 |
| 4.136800000000053 | 6.066 | 19.613 | 41.16 |
| 4.140750000000053 | 6.083 | 19.646 | 41.209 |
| 4.144700000000053 | 6.1 | 19.679 | 41.257 |
| 4.148650000000052 | 6.117 | 19.711 | 41.306 |
| 4.152600000000052 | 6.134 | 19.744 | 41.354 |
| 4.156550000000052 | 6.151 | 19.777 | 41.403 |
| 4.160500000000051 | 6.168 | 19.81 | 41.452 |
| 4.164450000000051 | 6.185 | 19.843 | 41.5 |
| 4.168400000000051 | 6.202 | 19.876 | 41.549 |
| 4.17235000000005 | 6.219 | 19.909 | 41.598 |
| 4.17630000000005 | 6.236 | 19.941 | 41.647 |
| 4.18025000000005 | 6.253 | 19.974 | 41.695 |
| 4.184200000000049 | 6.271 | 20.008 | 41.744 |
| 4.188150000000049 | 6.288 | 20.041 | 41.793 |
| 4.192100000000049 | 6.305 | 20.074 | 41.842 |
| 4.196050000000048 | 6.323 | 20.107 | 41.891 |
| 4.200000000000048 | 6.34 | 20.14 | 41.94 |